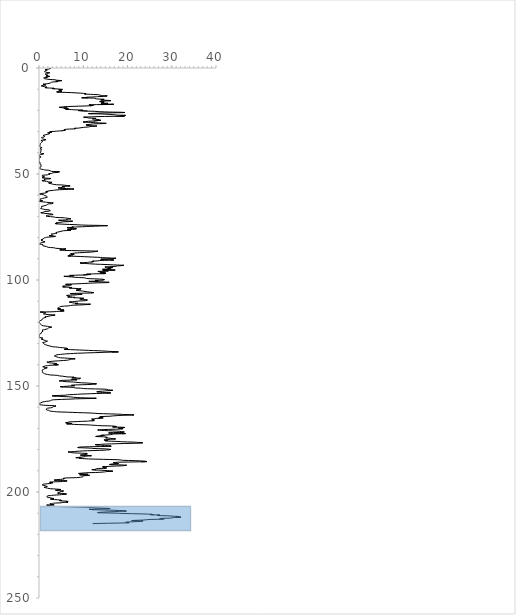
| Category | Series 0 |
|---|---|
| 2.2511769205039776 | 0 |
| 2.688813636029843 | 0.09 |
| 2.639082359440988 | 0.18 |
| 2.4865723846624084 | 0.27 |
| 2.3605859592779366 | 0.36 |
| 2.3108546751065977 | 0.45 |
| 2.1019828070659496 | 0.54 |
| 1.8765333205108918 | 0.63 |
| 1.3891651809407195 | 0.72 |
| 1.2001857398686149 | 0.81 |
| 1.3991114992662654 | 0.9 |
| 1.8400636023842034 | 0.99 |
| 1.7074464212776368 | 1.08 |
| 1.6577151164559263 | 1.17 |
| 1.4289502979283457 | 1.26 |
| 1.5151515067449355 | 1.35 |
| 1.581460204059943 | 1.44 |
| 1.5748291525476514 | 1.53 |
| 1.4190039795807288 | 1.62 |
| 1.3361182729211523 | 1.71 |
| 1.2499171785039467 | 1.8 |
| 1.4985743539476972 | 1.89 |
| 1.6742920883038348 | 1.98 |
| 1.7505468895784435 | 2.07 |
| 2.06219739652129 | 2.16 |
| 2.403686778767736 | 2.25 |
| 2.118559764024824 | 2.34 |
| 1.9992041701688223 | 2.43 |
| 2.005835245123876 | 2.52 |
| 2.0323587407710684 | 2.61 |
| 1.6742920883038348 | 2.7 |
| 1.4753665171510322 | 2.79 |
| 1.3759033923663697 | 2.88 |
| 1.3062794467804095 | 2.97 |
| 1.3659570748759664 | 3.06 |
| 1.7140773832092684 | 3.15 |
| 1.6146143542890554 | 3.24 |
| 1.6543995175551742 | 3.33 |
| 2.029043268550302 | 3.42 |
| 2.0655128686463993 | 3.51 |
| 1.866586993653683 | 3.6 |
| 1.6378223610090072 | 3.69 |
| 2.0555665381910995 | 3.78 |
| 2.1815529662097557 | 3.87 |
| 2.4335255227741737 | 3.96 |
| 2.2710694808998455 | 4.05 |
| 1.9096876664495908 | 4.14 |
| 1.5250978274360967 | 4.23 |
| 1.6411378322695447 | 4.32 |
| 1.859956159351224 | 4.41 |
| 1.5317286773486711 | 4.5 |
| 1.3526955468908735 | 4.59 |
| 1.047675806992692 | 4.68 |
| 1.2698096862087744 | 4.77 |
| 1.1106689501454097 | 4.86 |
| 0.9747364724776975 | 4.95 |
| 1.2764405317984906 | 5.04 |
| 1.3659570748759664 | 5.13 |
| 1.4753665171510322 | 5.22 |
| 1.9992041701688223 | 5.31 |
| 2.4998341961092723 | 5.4 |
| 3.1231349836464326 | 5.49 |
| 3.766328347748789 | 5.58 |
| 3.968569597615182 | 5.67 |
| 3.9984082560363983 | 5.76 |
| 4.552085511219727 | 5.85 |
| 5.165440004668776 | 5.94 |
| 5.012930056960483 | 6.03 |
| 4.27358926273196 | 6.12 |
| 3.7895367638452693 | 6.21 |
| 3.9652542277449854 | 6.3 |
| 4.257012101671626 | 6.39 |
| 3.8226908019890953 | 6.48 |
| 3.3717920385836173 | 6.57 |
| 2.8678468397003125 | 6.66 |
| 2.8181153529727174 | 6.75 |
| 2.9673098437245353 | 6.84 |
| 2.9838872483696677 | 6.93 |
| 2.9838872483696677 | 7.02 |
| 2.523042239277359 | 7.11 |
| 2.6423976168359316 | 7.2 |
| 2.363901540302277 | 7.29 |
| 1.9958889157170971 | 7.38 |
| 1.6179298253619614 | 7.47 |
| 1.210132054585035 | 7.56 |
| 0.9448975854221768 | 7.65 |
| 0.7293946084532117 | 7.74 |
| 0.9813672044891891 | 7.83 |
| 1.5516211482595383 | 7.92 |
| 1.4156886503711517 | 8.01 |
| 0.9813672044891891 | 8.1 |
| 0.8885352125704379 | 8.19 |
| 0.9482129891971947 | 8.28 |
| 0.8288575136844936 | 8.37 |
| 0.48405274983837326 | 8.46 |
| 0.4674756474982721 | 8.55 |
| 0.7957032091731224 | 8.64 |
| 0.9681055656056679 | 8.73 |
| 1.2068164745981702 | 8.82 |
| 1.5018898248292947 | 8.91 |
| 1.7472316362120328 | 9 |
| 1.899741556088483 | 9.09 |
| 1.7240235988200199 | 9.18 |
| 1.3891651809407195 | 9.27 |
| 1.7240235988200199 | 9.36 |
| 2.3572709648930514 | 9.45 |
| 3.3320073127465917 | 9.54 |
| 3.2889067873987834 | 9.63 |
| 2.9805715586778496 | 9.72 |
| 3.670181068392891 | 9.81 |
| 4.323320708350091 | 9.9 |
| 4.548770139292955 | 9.99 |
| 5.308003841765803 | 10.08 |
| 5.026191816606629 | 10.17 |
| 4.843843267119453 | 10.26 |
| 4.442676071814309 | 10.35 |
| 4.237119828964742 | 10.44 |
| 4.409521959685211 | 10.53 |
| 4.847158639910798 | 10.62 |
| 5.082554043291679 | 10.71 |
| 5.02287654866391 | 10.8 |
| 4.707910564566722 | 10.89 |
| 5.158808941232753 | 10.98 |
| 5.347788610989579 | 11.07 |
| 4.7609573163784304 | 11.16 |
| 3.9917780216767653 | 11.25 |
| 3.905576724221334 | 11.34 |
| 4.525562012206225 | 11.43 |
| 6.143491591374976 | 11.52 |
| 7.264106898037925 | 11.61 |
| 8.116172819134166 | 11.7 |
| 8.126118958566957 | 11.79 |
| 9.45229089747151 | 11.88 |
| 10.118692241760671 | 11.97 |
| 10.609375633100557 | 12.06 |
| 10.47012820275636 | 12.15 |
| 10.291094810403246 | 12.24 |
| 10.718784944571436 | 12.33 |
| 11.666998328095717 | 12.42 |
| 12.340029772184055 | 12.51 |
| 13.467277133806906 | 12.6 |
| 13.633048653059973 | 12.69 |
| 13.394337212797394 | 12.78 |
| 13.467277133806906 | 12.87 |
| 14.057424081389481 | 12.96 |
| 14.408859593639377 | 13.05 |
| 15.41674959126749 | 13.14 |
| 15.502951546290362 | 13.23 |
| 14.975798129098838 | 13.32 |
| 14.49174390523715 | 13.41 |
| 13.261719469984143 | 13.5 |
| 12.94675448701678 | 13.59 |
| 11.87918568351841 | 13.68 |
| 10.851402758680583 | 13.77 |
| 10.678999682306344 | 13.86 |
| 10.443604425358146 | 13.95 |
| 9.64790124887687 | 14.04 |
| 11.13652917873431 | 14.13 |
| 12.27040638581407 | 14.22 |
| 12.588687480111965 | 14.31 |
| 12.58205762972516 | 14.4 |
| 12.459386131362562 | 14.49 |
| 12.9732776399588 | 14.58 |
| 13.848550866699371 | 14.67 |
| 14.723824746982531 | 14.76 |
| 14.720509057342223 | 14.85 |
| 14.534845811556089 | 14.94 |
| 13.957960052398994 | 15.03 |
| 13.91154341872643 | 15.12 |
| 14.637623771868846 | 15.21 |
| 15.81128515361935 | 15.3 |
| 16.21576803009936 | 15.39 |
| 15.744976735910502 | 15.48 |
| 14.660832029472795 | 15.57 |
| 14.385650397184202 | 15.66 |
| 14.103838983637749 | 15.75 |
| 13.709303308928355 | 15.84 |
| 13.490484592252294 | 15.93 |
| 14.727138673264578 | 16.02 |
| 14.866388919595883 | 16.11 |
| 14.780187813839923 | 16.2 |
| 14.53152917353584 | 16.29 |
| 14.077315843241212 | 16.38 |
| 13.91154341872643 | 16.47 |
| 14.369073537734279 | 16.56 |
| 15.595783086478878 | 16.65 |
| 15.234400327316699 | 16.74 |
| 14.740401594806714 | 16.83 |
| 13.99774530885122 | 16.92 |
| 14.803395257201302 | 17.01 |
| 16.87885489133338 | 17.1 |
| 16.235659767779893 | 17.19 |
| 12.979908197344473 | 17.28 |
| 11.289039678539678 | 17.37 |
| 11.696837314859158 | 17.46 |
| 11.945495035442924 | 17.55 |
| 12.29361385754075 | 17.64 |
| 12.25382863935043 | 17.73 |
| 11.521119682128807 | 17.82 |
| 10.635899401683808 | 17.91 |
| 8.978184021596084 | 18 |
| 7.678535783838194 | 18.09 |
| 6.471719674192271 | 18.18 |
| 5.576553189633477 | 18.27 |
| 5.238379638221085 | 18.36 |
| 4.9698296941227005 | 18.45 |
| 4.558716517542522 | 18.54 |
| 4.654863705540776 | 18.63 |
| 5.245010596951963 | 18.72 |
| 5.994297650711471 | 18.81 |
| 6.421987978319282 | 18.9 |
| 5.629599928818763 | 18.99 |
| 5.407466419743819 | 19.08 |
| 6.004244369142409 | 19.17 |
| 6.627545034855889 | 19.26 |
| 6.0075590793260085 | 19.35 |
| 6.226377584612452 | 19.44 |
| 6.859624916808982 | 19.53 |
| 7.274053017876215 | 19.62 |
| 7.840991728299215 | 19.71 |
| 9.00802370930272 | 19.8 |
| 9.879981679505551 | 19.89 |
| 9.561700292055326 | 19.98 |
| 8.838936065180285 | 20.07 |
| 8.65658726442283 | 20.16 |
| 8.998076944416704 | 20.25 |
| 10.997280969241833 | 20.34 |
| 12.469332646700062 | 20.43 |
| 13.11915635361981 | 20.52 |
| 13.573369873090096 | 20.61 |
| 14.803395257201302 | 20.7 |
| 15.980373292497529 | 20.79 |
| 18.523307478056307 | 20.88 |
| 19.421789020455876 | 20.97 |
| 18.858166187108623 | 21.06 |
| 16.587096222008178 | 21.15 |
| 14.425436611839354 | 21.24 |
| 13.09926385368142 | 21.33 |
| 11.892447595903104 | 21.42 |
| 11.172999545035896 | 21.51 |
| 12.03169617169803 | 21.6 |
| 14.20993248543635 | 21.69 |
| 15.111730745065605 | 21.78 |
| 16.059942828546383 | 21.87 |
| 15.844439829949511 | 21.96 |
| 16.9186400244278 | 22.05 |
| 16.749551877014284 | 22.14 |
| 17.71765756568713 | 22.23 |
| 19.56103731815307 | 22.32 |
| 19.435051100236358 | 22.41 |
| 18.718917006150328 | 22.5 |
| 18.48352232671391 | 22.59 |
| 19.30243328891959 | 22.68 |
| 17.429215689416395 | 22.77 |
| 14.770240581239042 | 22.86 |
| 12.853921838189866 | 22.95 |
| 11.819508820322275 | 23.04 |
| 10.354088076356781 | 23.13 |
| 10.082222275424662 | 23.22 |
| 10.208208689124545 | 23.31 |
| 10.907764625199793 | 23.4 |
| 11.027120251898483 | 23.49 |
| 11.182945131897029 | 23.58 |
| 11.948809747896515 | 23.67 |
| 12.890391380094766 | 23.76 |
| 12.611896616488602 | 23.85 |
| 12.051588490517883 | 23.94 |
| 12.489225118457117 | 24.03 |
| 12.538955745553986 | 24.12 |
| 12.439493798967105 | 24.21 |
| 12.535640056024056 | 24.3 |
| 13.457330875891 | 24.39 |
| 13.619786499772516 | 24.48 |
| 13.11915635361981 | 24.57 |
| 13.938068289002075 | 24.66 |
| 13.812082071085365 | 24.75 |
| 13.838605368576406 | 24.84 |
| 13.924806331218164 | 24.93 |
| 12.320137991274944 | 25.02 |
| 11.156421959088252 | 25.11 |
| 11.212784117998243 | 25.2 |
| 11.196207152923424 | 25.29 |
| 10.393872875667668 | 25.38 |
| 9.97281342042185 | 25.47 |
| 10.41708124346218 | 25.56 |
| 11.726675322081292 | 25.65 |
| 12.386446370979433 | 25.74 |
| 12.824083961426059 | 25.83 |
| 13.722564500701779 | 25.92 |
| 14.922751037337537 | 26.01 |
| 15.184669760592676 | 26.1 |
| 14.91943518228813 | 26.19 |
| 13.517008699423888 | 26.28 |
| 12.359923210936891 | 26.37 |
| 12.005171898639063 | 26.46 |
| 11.988594959758924 | 26.55 |
| 12.028379372536389 | 26.64 |
| 10.867979262261768 | 26.73 |
| 10.616007012057393 | 26.82 |
| 10.6458456014122 | 26.91 |
| 10.493335991758775 | 27 |
| 10.7254164426773 | 27.09 |
| 11.315561866067869 | 27.18 |
| 12.194151776154294 | 27.27 |
| 13.062793488593933 | 27.36 |
| 12.787612628165467 | 27.45 |
| 11.73662239089184 | 27.54 |
| 11.796300365080949 | 27.63 |
| 11.670314147164241 | 27.72 |
| 11.163052476225353 | 27.81 |
| 10.609375633100557 | 27.9 |
| 10.08885376640056 | 27.99 |
| 9.873350790808654 | 28.08 |
| 10.062329870544993 | 28.17 |
| 10.178370001940698 | 28.26 |
| 8.945030448694812 | 28.35 |
| 8.056494947302985 | 28.44 |
| 8.321729917541793 | 28.53 |
| 8.140806829960548 | 28.62 |
| 7.961815543868581 | 28.71 |
| 6.841460170377833 | 28.8 |
| 6.228247327455203 | 28.89 |
| 5.883523004408026 | 28.98 |
| 5.886837611470963 | 29.07 |
| 5.638238139287209 | 29.16 |
| 5.97964755737901 | 29.25 |
| 6.075773333883023 | 29.34 |
| 6.049255921736279 | 29.43 |
| 5.9730183810155495 | 29.52 |
| 5.250422673136064 | 29.61 |
| 4.600748968048323 | 29.7 |
| 3.99748080257877 | 29.79 |
| 3.4041564064220666 | 29.88 |
| 2.9069575681452684 | 29.97 |
| 2.4462196240704266 | 30.06 |
| 2.4163876964738553 | 30.15 |
| 2.883754859223419 | 30.24 |
| 2.807517853225645 | 30.33 |
| 2.1777321308368918 | 30.42 |
| 2.1744174275789065 | 30.51 |
| 1.9258180474495388 | 30.6 |
| 1.9655937845814857 | 30.69 |
| 2.190990751302221 | 30.78 |
| 2.485995610109222 | 30.87 |
| 2.47936631052608 | 30.96 |
| 2.4429050561672874 | 31.05 |
| 2.413072992767238 | 31.14 |
| 2.263913143448734 | 31.23 |
| 1.9556497637803243 | 31.32 |
| 1.7733434909971448 | 31.41 |
| 1.4219895351316525 | 31.5 |
| 1.2595710122178758 | 31.59 |
| 1.1402432151791924 | 31.68 |
| 0.9115317045086462 | 31.77 |
| 0.9579369643974255 | 31.86 |
| 1.0441181461763382 | 31.95 |
| 1.2628857132400468 | 32.04 |
| 1.4286188289524322 | 32.13 |
| 1.2894030220246389 | 32.22 |
| 1.123670030620423 | 32.31 |
| 1.2960324388959454 | 32.4 |
| 1.2396831355507596 | 32.49 |
| 1.1634459274584352 | 32.58 |
| 0.792203910294881 | 32.67 |
| 0.6098975802833918 | 32.76 |
| 0.5402897172086185 | 32.85 |
| 0.49056979285796165 | 32.94 |
| 0.47731113299123673 | 33.03 |
| 0.4408498559595504 | 33.12 |
| 0.41433259814998413 | 33.21 |
| 0.6198415984218091 | 33.3 |
| 0.8187211513954361 | 33.39 |
| 0.9247903626268048 | 33.48 |
| 0.8618117758143374 | 33.57 |
| 1.10709672204951 | 33.66 |
| 1.5877225119369023 | 33.75 |
| 1.6208691302665026 | 33.84 |
| 1.445191990230083 | 33.93 |
| 1.1037820870187067 | 34.02 |
| 0.7192814013169356 | 34.11 |
| 0.4275912567476659 | 34.2 |
| 0.43422053497219165 | 34.29 |
| 0.3944446257055664 | 34.38 |
| 0.2618581878475798 | 34.47 |
| 0.41433259814998413 | 34.56 |
| 0.8352945399933143 | 34.65 |
| 1.0176008148607985 | 34.74 |
| 0.8684411531871686 | 34.83 |
| 0.8054625769363352 | 34.92 |
| 0.9115317045086462 | 35.01 |
| 0.6861347542556911 | 35.1 |
| 0.513772407395111 | 35.19 |
| 0.41433259814998413 | 35.28 |
| 0.40438862831355105 | 35.37 |
| 0.43090590095963704 | 35.46 |
| 0.3513540476010533 | 35.55 |
| 0.2883754866188265 | 35.64 |
| 0.26517284536042257 | 35.73 |
| 0.2419702379988303 | 35.82 |
| 0.1823063546977155 | 35.91 |
| 0.12264243459691074 | 36 |
| 0.13258642067974868 | 36.09 |
| 0.32152208020078915 | 36.18 |
| 0.2552288566269716 | 36.27 |
| 0.21876759496464748 | 36.36 |
| 0.1823063546977155 | 36.45 |
| 0.11932779239569775 | 36.54 |
| 0.11601312688541636 | 36.63 |
| 0.13258642067974868 | 36.72 |
| 0.12927175539525518 | 36.81 |
| 0.0762371938638118 | 36.9 |
| 0.056349233551244785 | 36.99 |
| 0.0762371938638118 | 37.08 |
| 0.21545294041682875 | 37.17 |
| 0.2983194653940919 | 37.26 |
| 0.32815140075128224 | 37.35 |
| 0.31820741089183563 | 37.44 |
| 0.3845006566248226 | 37.53 |
| 0.692764076538938 | 37.62 |
| 0.5270310675350603 | 37.71 |
| 0.32152208020078915 | 37.8 |
| 0.2883754866188265 | 37.89 |
| 0.3778713248055464 | 37.98 |
| 0.43090590095963704 | 38.07 |
| 0.503828391948496 | 38.16 |
| 0.4608906375102383 | 38.25 |
| 0.3448390002059624 | 38.34 |
| 0.39125968994519666 | 38.43 |
| 0.5205743125439757 | 38.52 |
| 0.6167313142230625 | 38.61 |
| 0.7493617150457694 | 38.7 |
| 0.6001525168202945 | 38.79 |
| 0.4277330136184033 | 38.88 |
| 0.36804934078442614 | 38.97 |
| 0.351470529985123 | 39.06 |
| 0.437680280970444 | 39.15 |
| 0.5039954791965717 | 39.24 |
| 0.5437845796825201 | 39.33 |
| 0.48741668540585653 | 39.42 |
| 0.4476275879270094 | 39.51 |
| 0.39457543744570195 | 39.6 |
| 0.4409960573051831 | 39.69 |
| 0.4277330136184033 | 39.78 |
| 0.21220862734575313 | 39.87 |
| 0.0795782379325111 | 39.96 |
| 0.013263039185697097 | 40.05 |
| 0.15584069621665958 | 40.14 |
| 0.2553134966762873 | 40.23 |
| 0.5404688363478712 | 40.32 |
| 1.061043109850693 | 40.41 |
| 1.230146816242189 | 40.5 |
| 1.0743061672754894 | 40.59 |
| 0.7526774674138614 | 40.68 |
| 0.5371530599170911 | 40.77 |
| 0.3448390002059624 | 40.86 |
| 0.3713651169149385 | 40.95 |
| 0.16910374466210495 | 41.04 |
| 0.0 | 41.13 |
| 0.0 | 41.22 |
| 0.019894559102658943 | 41.31 |
| 0.14589343989359593 | 41.4 |
| 0.1923140785732119 | 41.49 |
| 0.10278855607665452 | 41.58 |
| 0.05968367453137687 | 41.67 |
| 0.03647335629487137 | 41.76 |
| 0.029841835905869918 | 41.85 |
| 0.4675221055533252 | 41.94 |
| 0.4774693732023226 | 42.03 |
| 0.31831293968177277 | 42.12 |
| 0.14920919347858455 | 42.21 |
| 0.11936735245269613 | 42.3 |
| 0.046420639186319154 | 42.39 |
| 0.046420639186319154 | 42.48 |
| 0.03315759553707296 | 42.57 |
| 0.0795782379325111 | 42.66 |
| 0.10610430596182871 | 42.75 |
| 0.11273582366486266 | 42.84 |
| 0.1259988716227402 | 42.93 |
| 0.0928412744531417 | 43.02 |
| 0.046420639186319154 | 43.11 |
| 0.02652607599750737 | 43.2 |
| 0.0033157597337947534 | 43.29 |
| 0.029841835905869918 | 43.38 |
| 0.05305215375427108 | 43.47 |
| 0.06631519611317266 | 43.56 |
| 0.006631519373840251 | 43.65 |
| 0.03315759553707296 | 43.74 |
| 0.019894559102658943 | 43.83 |
| 0.019894559102658943 | 43.92 |
| 0.023210321232419347 | 44.01 |
| 0.046420639186319154 | 44.1 |
| 0.05305215375427108 | 44.19 |
| 0.03647335629487137 | 44.28 |
| 0.02652607599750737 | 44.37 |
| 0.013263039185697097 | 44.46 |
| 0.1591564606032166 | 44.55 |
| 0.2851553253617323 | 44.64 |
| 0.12268310714934057 | 44.73 |
| 0.023210321232419347 | 44.82 |
| 0.02652607599750737 | 44.91 |
| 0.11936735245269613 | 45 |
| 0.18899832498270341 | 45.09 |
| 0.3481547650870792 | 45.18 |
| 0.4807851658601089 | 45.27 |
| 0.47415364112148395 | 45.36 |
| 0.39125968994519666 | 45.45 |
| 0.21552436828819063 | 45.54 |
| 0.27520803931319804 | 45.63 |
| 0.45094332512455343 | 45.72 |
| 0.4841009090582388 | 45.81 |
| 0.32162870468395405 | 45.9 |
| 0.22547165329792873 | 45.99 |
| 0.43436453298016287 | 46.08 |
| 0.500679741303553 | 46.17 |
| 0.4608906375102383 | 46.26 |
| 0.47415364112148395 | 46.35 |
| 0.4012069169048769 | 46.44 |
| 0.39457543744570195 | 46.53 |
| 0.513942786728652 | 46.62 |
| 0.4045226929448662 | 46.71 |
| 0.36473359379430353 | 46.8 |
| 0.29178684699353574 | 46.89 |
| 0.2188401217245175 | 46.98 |
| 0.08952551469620126 | 47.07 |
| 0.10610430596182871 | 47.16 |
| 0.2188401217245175 | 47.25 |
| 0.25199774293785243 | 47.34 |
| 0.2188401217245175 | 47.43 |
| 0.22215588871708042 | 47.52 |
| 0.27189230487105664 | 47.61 |
| 0.4608906375102383 | 47.7 |
| 0.6167313142230625 | 47.79 |
| 0.9615703947876317 | 47.88 |
| 1.1472529601303005 | 47.97 |
| 1.210252452659474 | 48.06 |
| 1.5882490390562842 | 48.15 |
| 2.241453570432692 | 48.24 |
| 2.387347075018311 | 48.33 |
| 2.1917171178722685 | 48.42 |
| 2.0955602004416605 | 48.51 |
| 2.374084054537571 | 48.6 |
| 2.380715577914686 | 48.69 |
| 2.868132166589213 | 48.78 |
| 4.3138033740422905 | 48.87 |
| 4.6387480529220575 | 48.96 |
| 4.579064249750235 | 49.05 |
| 4.472960127956624 | 49.14 |
| 4.486223195626614 | 49.23 |
| 3.859544160312783 | 49.32 |
| 3.193076494287381 | 49.41 |
| 3.030604533700897 | 49.5 |
| 3.0936040345205704 | 49.59 |
| 3.040551872658502 | 49.68 |
| 2.8018168673698605 | 49.77 |
| 2.2082961539358283 | 49.86 |
| 2.4735570303245416 | 49.95 |
| 2.6658707924663285 | 50.04 |
| 2.2082961539358283 | 50.13 |
| 2.27792717227444 | 50.22 |
| 2.2116118723485645 | 50.31 |
| 1.9231406798727733 | 50.4 |
| 1.379356083791402 | 50.49 |
| 0.7758878366650205 | 50.58 |
| 0.706256882183133 | 50.67 |
| 0.9350442737777486 | 50.76 |
| 0.8289399781125159 | 50.85 |
| 0.6333101498813551 | 50.94 |
| 0.6764149845787213 | 51.03 |
| 0.7559932885813289 | 51.12 |
| 0.5902052027422915 | 51.21 |
| 0.8819921266869719 | 51.3 |
| 1.2533572254824024 | 51.39 |
| 0.9350442737777486 | 51.48 |
| 0.8587817540798743 | 51.57 |
| 0.7990981190988544 | 51.66 |
| 0.7128883671015994 | 51.75 |
| 0.6929938215157302 | 51.84 |
| 1.3130409017981686 | 51.93 |
| 2.1386650536636758 | 52.02 |
| 2.679133818922997 | 52.11 |
| 2.798501279603328 | 52.2 |
| 2.387347075018311 | 52.29 |
| 1.468881576399915 | 52.38 |
| 1.12072686433671 | 52.47 |
| 1.0577273649889436 | 52.56 |
| 1.031201229641617 | 52.65 |
| 1.210252452659474 | 52.74 |
| 1.4556185756721296 | 52.83 |
| 1.3859877001891783 | 52.92 |
| 1.097516438803991 | 53.01 |
| 0.6664677129092176 | 53.1 |
| 0.7261513481147034 | 53.19 |
| 1.047780042015487 | 53.28 |
| 1.3196724076007476 | 53.37 |
| 1.6810901780646221 | 53.46 |
| 1.578301745179426 | 53.55 |
| 1.6413011118313552 | 53.64 |
| 2.1618752603367755 | 53.73 |
| 2.5365562853141377 | 53.82 |
| 2.897974249171495 | 53.91 |
| 2.8316589782347745 | 54 |
| 2.539871834836923 | 54.09 |
| 2.175138299672602 | 54.18 |
| 2.085613119851076 | 54.27 |
| 2.2049803515583206 | 54.36 |
| 2.503398631303464 | 54.45 |
| 2.4569779606095645 | 54.54 |
| 2.6061870231225455 | 54.63 |
| 2.9609737483536747 | 54.72 |
| 3.0339201227369355 | 54.81 |
| 3.3091281127126497 | 54.9 |
| 3.481547682255469 | 54.99 |
| 3.9888587081447247 | 55.08 |
| 5.179216488717733 | 55.17 |
| 5.69647517762266 | 55.26 |
| 5.766106056568264 | 55.35 |
| 5.892105012210603 | 55.44 |
| 6.604993795214903 | 55.53 |
| 7.036042357406702 | 55.62 |
| 6.558573485505514 | 55.71 |
| 5.706422252277798 | 55.8 |
| 5.189163809806414 | 55.89 |
| 5.451109054481205 | 55.98 |
| 5.829105502114258 | 56.07 |
| 5.570476224202899 | 56.16 |
| 5.633475732242257 | 56.25 |
| 5.4113200172039715 | 56.34 |
| 4.9437976790000135 | 56.43 |
| 4.330382138248833 | 56.52 |
| 4.267383000540548 | 56.61 |
| 4.333698205705233 | 56.7 |
| 5.242215830564409 | 56.79 |
| 6.289996571271416 | 56.88 |
| 7.400775574301195 | 56.97 |
| 7.881560788349246 | 57.06 |
| 7.526774525336473 | 57.15 |
| 6.7575182390157 | 57.24 |
| 5.6666336011730065 | 57.33 |
| 4.575748654009666 | 57.42 |
| 4.0687071681491815 | 57.51 |
| 3.56799420422596 | 57.6 |
| 3.3192955933079924 | 57.69 |
| 2.9445899819320784 | 57.78 |
| 2.4803527785030455 | 57.87 |
| 2.2946579475294873 | 57.96 |
| 1.989587727933015 | 58.05 |
| 1.8072089082311518 | 58.14 |
| 1.6878337368128156 | 58.23 |
| 2.0492754636049435 | 58.32 |
| 2.1719666517564646 | 58.41 |
| 1.4955068314890128 | 58.5 |
| 1.3694996175803407 | 58.59 |
| 1.5717744931208575 | 58.68 |
| 1.7276253305319635 | 58.77 |
| 1.8569485616117674 | 58.86 |
| 1.4888748830437444 | 58.95 |
| 1.1871207878792447 | 59.04 |
| 0.7096196065397431 | 59.13 |
| 0.3713897476269761 | 59.22 |
| 0.32496601412019205 | 59.31 |
| 0.2884902260672003 | 59.4 |
| 0.09947939374301525 | 59.49 |
| 0.2122226784847849 | 59.58 |
| 0.5902443545247013 | 59.67 |
| 0.9947938838398479 | 59.76 |
| 1.2136485116877573 | 59.85 |
| 1.0180058129924057 | 59.94 |
| 0.9583182060938404 | 60.03 |
| 1.1804887348045139 | 60.12 |
| 1.333023921240246 | 60.21 |
| 1.4722948733802674 | 60.3 |
| 1.631462016869361 | 60.39 |
| 1.7110455955033386 | 60.48 |
| 1.7641012947499817 | 60.57 |
| 1.7442052372809769 | 60.66 |
| 1.7607852538706865 | 60.75 |
| 1.896740446526887 | 60.84 |
| 2.0227477955154014 | 60.93 |
| 2.0161156204956323 | 61.02 |
| 1.8271049478178303 | 61.11 |
| 1.5750902955494923 | 61.2 |
| 1.1970687382925402 | 61.29 |
| 1.0511656000110476 | 61.38 |
| 0.8721026546785846 | 61.47 |
| 0.7361474836427404 | 61.56 |
| 0.5405046828267539 | 61.65 |
| 0.4310773507164851 | 61.74 |
| 0.24869847192602718 | 61.83 |
| 0.1890108602563872 | 61.92 |
| 0.17574692013765286 | 62.01 |
| 0.2785422800683639 | 62.1 |
| 0.22548661015918797 | 62.19 |
| 0.1591670183875188 | 62.28 |
| 0.25533043312335596 | 62.37 |
| 0.36475778871986575 | 62.46 |
| 0.7958351551145767 | 62.55 |
| 0.7460954606690159 | 62.64 |
| 0.34817785637656307 | 62.73 |
| 0.07626753489682106 | 62.82 |
| 0.1558510323170614 | 62.91 |
| 0.32496601412019205 | 63 |
| 0.6598799560238316 | 63.09 |
| 1.0843254040545227 | 63.18 |
| 1.4888748830437444 | 63.27 |
| 1.7276253305319635 | 63.36 |
| 2.254866156398137 | 63.45 |
| 2.7522631782052125 | 63.54 |
| 3.2231320294363597 | 63.63 |
| 3.246343949730545 | 63.72 |
| 3.1501807055804734 | 63.81 |
| 3.060649229462538 | 63.9 |
| 2.8285307637332 | 63.99 |
| 2.254866156398137 | 64.08 |
| 1.9763238369087957 | 64.17 |
| 1.9829557713433583 | 64.26 |
| 1.992903749638213 | 64.35 |
| 1.9232682531078609 | 64.44 |
| 2.1189110700900753 | 64.53 |
| 1.896740446526887 | 64.62 |
| 1.7176773574299409 | 64.71 |
| 1.555194572824844 | 64.8 |
| 1.3628676712254535 | 64.89 |
| 1.3098119687217902 | 64.98 |
| 1.326391880450182 | 65.07 |
| 0.9251583099116657 | 65.16 |
| 0.5736645118201035 | 65.25 |
| 0.4410253062747674 | 65.34 |
| 0.4343933469359641 | 65.43 |
| 0.4310773507164851 | 65.52 |
| 0.39460156816288955 | 65.61 |
| 0.40123352686648195 | 65.7 |
| 0.6001923284672948 | 65.79 |
| 0.726199518005363 | 65.88 |
| 0.7527273885865943 | 65.97 |
| 0.6101402476268164 | 66.06 |
| 0.48744901862269935 | 66.15 |
| 0.35149384509311904 | 66.24 |
| 0.36475778871986575 | 66.33 |
| 0.5338727232627193 | 66.42 |
| 0.7858871884493054 | 66.51 |
| 1.0445335821136044 | 66.6 |
| 1.2003847716714897 | 66.69 |
| 1.3960274836562143 | 66.78 |
| 2.0293795055063324 | 66.87 |
| 2.3211858528257667 | 66.96 |
| 2.314553890546444 | 67.05 |
| 2.1984946604051596 | 67.14 |
| 2.3377657747668494 | 67.23 |
| 2.563252291874266 | 67.32 |
| 2.6196238909252423 | 67.41 |
| 2.377557347405529 | 67.5 |
| 1.992903749638213 | 67.59 |
| 1.303179928299755 | 67.68 |
| 1.2700202640431575 | 67.77 |
| 1.2302284054638961 | 67.86 |
| 1.1473290641737295 | 67.95 |
| 1.1771728245556377 | 68.04 |
| 0.8588387221264413 | 68.13 |
| 0.4078654901659683 | 68.22 |
| 0.4310773507164851 | 68.31 |
| 0.7560434296752947 | 68.4 |
| 1.0710614664972407 | 68.49 |
| 1.36618358205949 | 68.58 |
| 1.8204730138874616 | 68.67 |
| 2.404085365490385 | 68.76 |
| 2.8849022537457727 | 68.85 |
| 3.0838611100174127 | 68.94 |
| 3.0639651459788775 | 69.03 |
| 3.1999204661924874 | 69.12 |
| 2.9280101534987466 | 69.21 |
| 2.364293555924667 | 69.3 |
| 2.1653345836368847 | 69.39 |
| 1.9166362976811613 | 69.48 |
| 1.7806810057723492 | 69.57 |
| 1.8602645829710218 | 69.66 |
| 1.7641012947499817 | 69.75 |
| 1.5850383759602065 | 69.84 |
| 1.5850383759602065 | 69.93 |
| 1.9962198801278723 | 70.02 |
| 2.6129919528913965 | 70.11 |
| 2.9479058980914328 | 70.2 |
| 3.4453028427310612 | 70.29 |
| 3.6674733433114026 | 70.38 |
| 3.747057081870558 | 70.47 |
| 4.70869124472278 | 70.56 |
| 5.7366451907829 | 70.65 |
| 6.058294665065658 | 70.74 |
| 6.021819005627397 | 70.83 |
| 6.094770997209139 | 70.92 |
| 6.794442879552366 | 71.01 |
| 7.222203995360962 | 71.1 |
| 6.920450090796537 | 71.19 |
| 6.58553581214022 | 71.28 |
| 6.449580126043684 | 71.37 |
| 6.691646885553492 | 71.46 |
| 6.622011442596514 | 71.55 |
| 6.051663416883341 | 71.64 |
| 5.279039861071679 | 71.73 |
| 4.440096848880284 | 71.82 |
| 4.4301488244682385 | 71.91 |
| 5.189508037567738 | 72 |
| 5.802964164383987 | 72.09 |
| 6.864078330178977 | 72.18 |
| 7.596909277833075 | 72.27 |
| 7.646649265762988 | 72.36 |
| 6.701594641936732 | 72.45 |
| 5.617269474647312 | 72.54 |
| 5.355307515766264 | 72.63 |
| 4.977285602268613 | 72.72 |
| 4.692111053851232 | 72.81 |
| 4.503100481121606 | 72.9 |
| 4.237822017892859 | 72.99 |
| 3.889644292123894 | 73.08 |
| 4.00901940722707 | 73.17 |
| 4.144974636185239 | 73.26 |
| 3.6343138013420857 | 73.35 |
| 3.717213503097874 | 73.44 |
| 4.111814705780443 | 73.53 |
| 4.983917266937297 | 73.62 |
| 5.8759155879193825 | 73.71 |
| 6.9502933300147856 | 73.8 |
| 8.114202734353029 | 73.89 |
| 8.813874657480772 | 73.98 |
| 9.656132648983785 | 74.07 |
| 11.135060001122062 | 74.16 |
| 13.893955365726377 | 74.25 |
| 15.49225716379562 | 74.34 |
| 15.094339015363733 | 74.43 |
| 13.953643080373046 | 74.52 |
| 12.806312769997286 | 74.61 |
| 11.519714038068141 | 74.7 |
| 10.740458157082605 | 74.79 |
| 9.884935508934875 | 74.88 |
| 8.482276254975819 | 74.97 |
| 7.434427096958045 | 75.06 |
| 7.752760296544273 | 75.15 |
| 7.73949682992261 | 75.24 |
| 6.37331286250431 | 75.33 |
| 6.260569853511913 | 75.42 |
| 6.34678552127602 | 75.51 |
| 6.386576539290233 | 75.6 |
| 7.57701310982047 | 75.69 |
| 8.465695886164259 | 75.78 |
| 8.419272553133636 | 75.87 |
| 8.452432156217151 | 75.96 |
| 8.061146922766802 | 76.05 |
| 7.6168055498789675 | 76.14 |
| 7.04314085604702 | 76.23 |
| 6.356733270501177 | 76.32 |
| 6.529164048626305 | 76.41 |
| 7.228835936460458 | 76.5 |
| 7.162516309504877 | 76.59 |
| 6.234041881069508 | 76.68 |
| 5.5072940937904775 | 76.77 |
| 5.4741379436625826 | 76.86 |
| 5.454243895246596 | 76.95 |
| 4.980106384942731 | 77.04 |
| 4.953580736830462 | 77.13 |
| 4.784482729729127 | 77.22 |
| 4.48939002813121 | 77.31 |
| 4.1744034561028664 | 77.4 |
| 4.0981434191670045 | 77.49 |
| 4.134615275882 | 77.58 |
| 3.822944315913992 | 77.67 |
| 3.8328913395111868 | 77.76 |
| 4.081564997293933 | 77.85 |
| 3.7798410559631352 | 77.94 |
| 3.70689666193301 | 78.03 |
| 3.822944315913992 | 78.12 |
| 3.352121993013809 | 78.21 |
| 2.7685676733848084 | 78.3 |
| 2.821618046812406 | 78.39 |
| 2.715517267113848 | 78.48 |
| 2.6724136730408383 | 78.57 |
| 3.023872834703351 | 78.66 |
| 3.183023925664078 | 78.75 |
| 2.9874003149505666 | 78.84 |
| 2.85145895438065 | 78.93 |
| 2.619363297865466 | 79.02 |
| 2.311007926798926 | 79.11 |
| 2.5165782848625997 | 79.2 |
| 3.282493512017428 | 79.29 |
| 3.7168436835395897 | 79.38 |
| 3.6405836607367554 | 79.47 |
| 3.418435316381164 | 79.56 |
| 2.9011936334187247 | 79.65 |
| 2.234747969708578 | 79.74 |
| 1.7440317091311306 | 79.83 |
| 1.6147214505035707 | 79.92 |
| 1.5119364072845187 | 80.01 |
| 1.1969496571455032 | 80.1 |
| 1.0377983936794832 | 80.19 |
| 1.021220157177501 | 80.28 |
| 0.9748010178781417 | 80.37 |
| 1.0245358799876083 | 80.46 |
| 1.0344826706066652 | 80.55 |
| 0.9582228645652393 | 80.64 |
| 0.8355438463060114 | 80.73 |
| 0.7758621003157331 | 80.82 |
| 0.8255968568466308 | 80.91 |
| 0.4708222360510903 | 81 |
| 0.7858090018100191 | 81.09 |
| 0.9350132581803703 | 81.18 |
| 0.6697612471769722 | 81.27 |
| 0.4807692181245734 | 81.36 |
| 0.7228116357428374 | 81.45 |
| 0.8720158905986992 | 81.54 |
| 0.8919098710253229 | 81.63 |
| 0.7758621003157331 | 81.72 |
| 0.9781166524206988 | 81.81 |
| 1.1903182636051663 | 81.9 |
| 1.3759946397858662 | 81.99 |
| 1.4091512641334876 | 82.08 |
| 1.1339522550098615 | 82.17 |
| 0.9515915181834225 | 82.26 |
| 0.7327586225982202 | 82.35 |
| 0.7228116357428374 | 82.44 |
| 0.37466843581502923 | 82.53 |
| 0.3050397834065379 | 82.62 |
| 0.27519894420444546 | 82.71 |
| 0.2851458698698428 | 82.8 |
| 0.33819629692639064 | 82.89 |
| 0.11604773988480978 | 82.98 |
| 0.14257294591533354 | 83.07 |
| 0.3183023847128483 | 83.16 |
| 0.5868700572723419 | 83.25 |
| 0.8919098710253229 | 83.34 |
| 0.9449602493187123 | 83.43 |
| 0.8090186012891692 | 83.52 |
| 0.8057028900485682 | 83.61 |
| 0.8123342445069218 | 83.7 |
| 0.7526525009580045 | 83.79 |
| 0.8852785151120864 | 83.88 |
| 0.9980106360264205 | 83.97 |
| 1.3627320817330053 | 84.06 |
| 1.4854111759657815 | 84.15 |
| 1.6810344346379076 | 84.24 |
| 1.5152520056644212 | 84.33 |
| 1.541777068707844 | 84.42 |
| 1.7340847251844076 | 84.51 |
| 2.078912446676072 | 84.6 |
| 2.6027852792710653 | 84.69 |
| 3.3488064052345945 | 84.78 |
| 3.352121993013809 | 84.87 |
| 3.4515915724791006 | 84.96 |
| 3.7798410559631352 | 85.05 |
| 4.585543964127799 | 85.14 |
| 5.2718832010738454 | 85.23 |
| 6.080901662779832 | 85.32 |
| 6.236737332871558 | 85.41 |
| 5.948275732439613 | 85.5 |
| 5.520556805021588 | 85.59 |
| 5.179045267865435 | 85.68 |
| 4.6850131651364455 | 85.77 |
| 4.6850131651364455 | 85.86 |
| 5.208885840402673 | 85.95 |
| 5.676392696576049 | 86.04 |
| 7.383951673156938 | 86.13 |
| 9.731432249253364 | 86.22 |
| 11.86671082996313 | 86.31 |
| 13.288893163127755 | 86.4 |
| 13.046794747019518 | 86.49 |
| 12.798063787510888 | 86.58 |
| 12.662089790030567 | 86.67 |
| 12.890923034927518 | 86.76 |
| 11.697012745449658 | 86.85 |
| 10.814844414807451 | 86.94 |
| 10.297482766407338 | 87.03 |
| 9.086989379130742 | 87.12 |
| 8.665804912428504 | 87.21 |
| 8.075481748260131 | 87.3 |
| 7.8864456699847745 | 87.39 |
| 7.56143657665598 | 87.48 |
| 7.156833903060137 | 87.57 |
| 7.050707982216385 | 87.66 |
| 7.501740979037944 | 87.75 |
| 7.952774098057761 | 87.84 |
| 7.395615777431912 | 87.93 |
| 7.50505735014962 | 88.02 |
| 7.65098018167044 | 88.11 |
| 7.083872223874945 | 88.2 |
| 6.81855874633471 | 88.29 |
| 7.014227534854621 | 88.38 |
| 7.17009936025473 | 88.47 |
| 6.83514125967276 | 88.56 |
| 6.523397518329148 | 88.65 |
| 7.253009407356345 | 88.74 |
| 8.370642809185954 | 88.83 |
| 9.458428584721611 | 88.92 |
| 10.224521756888501 | 89.01 |
| 11.28577573529934 | 89.1 |
| 12.065134161836383 | 89.19 |
| 13.189401145142346 | 89.28 |
| 13.915695721238578 | 89.37 |
| 14.343515460870062 | 89.46 |
| 14.535866528921614 | 89.55 |
| 16.36321456372958 | 89.64 |
| 17.401254144322834 | 89.73 |
| 17.537226310283348 | 89.82 |
| 16.860677416636772 | 89.91 |
| 15.175935952306599 | 90 |
| 14.237388227467182 | 90.09 |
| 13.9422285087675 | 90.18 |
| 13.972075447261364 | 90.27 |
| 14.688422350817174 | 90.36 |
| 15.855801485867872 | 90.45 |
| 16.93363732377603 | 90.54 |
| 16.230558312887418 | 90.63 |
| 14.804496915216436 | 90.72 |
| 13.736609629256535 | 90.81 |
| 13.779724391725967 | 90.9 |
| 13.278943715353439 | 90.99 |
| 12.138094712748218 | 91.08 |
| 12.211057351356324 | 91.17 |
| 12.406725337255098 | 91.26 |
| 12.26743632272803 | 91.35 |
| 12.43988990845322 | 91.44 |
| 11.799821181261503 | 91.53 |
| 11.153119419962106 | 91.62 |
| 10.924286509110557 | 91.71 |
| 10.871223004380932 | 91.8 |
| 9.932676474271998 | 91.89 |
| 9.266076227924747 | 91.98 |
| 9.475011186022526 | 92.07 |
| 10.221205376621619 | 92.16 |
| 10.81816069801516 | 92.25 |
| 11.418433039781691 | 92.34 |
| 11.564354587548964 | 92.43 |
| 12.76489921557651 | 92.52 |
| 13.952176971961395 | 92.61 |
| 15.139456484180114 | 92.7 |
| 16.04483777409085 | 92.79 |
| 16.890525309709076 | 92.88 |
| 18.114283375674827 | 92.97 |
| 19.17222058731595 | 93.06 |
| 19.208702735226897 | 93.15 |
| 18.43266127177932 | 93.24 |
| 17.719629233898285 | 93.33 |
| 17.636719110749915 | 93.42 |
| 17.447683743054025 | 93.51 |
| 17.470898083223652 | 93.6 |
| 17.484164271925472 | 93.69 |
| 15.759626492190689 | 93.78 |
| 14.900673006156323 | 93.87 |
| 15.205782903169407 | 93.96 |
| 16.217291235942838 | 94.05 |
| 16.638477668209333 | 94.14 |
| 16.17417845503994 | 94.23 |
| 16.08463405967756 | 94.32 |
| 15.617019865242929 | 94.41 |
| 15.467780748235718 | 94.5 |
| 15.749676279678729 | 94.59 |
| 16.19076020240712 | 94.68 |
| 16.27367016096794 | 94.77 |
| 15.212416430340323 | 94.86 |
| 14.363412997384076 | 94.95 |
| 15.089709290182704 | 95.04 |
| 15.86906767449609 | 95.13 |
| 16.658375338683115 | 95.22 |
| 17.215532852089996 | 95.31 |
| 15.918813951942115 | 95.4 |
| 14.41979194298722 | 95.49 |
| 14.416477013958579 | 95.58 |
| 15.67671471341145 | 95.67 |
| 15.36497223213637 | 95.76 |
| 14.628727674672307 | 95.85 |
| 13.302158102569106 | 95.94 |
| 13.448081550879158 | 96.03 |
| 13.69349754373704 | 96.12 |
| 14.476171690766057 | 96.21 |
| 15.043279445435243 | 96.3 |
| 14.220807367201571 | 96.39 |
| 13.822836474852684 | 96.48 |
| 13.72002764787389 | 96.57 |
| 13.836102388640636 | 96.66 |
| 14.035087758245608 | 96.75 |
| 14.257288619139215 | 96.84 |
| 15.099659327762849 | 96.93 |
| 14.353464547884334 | 97.02 |
| 12.3934601434779 | 97.11 |
| 11.14648655662647 | 97.2 |
| 10.728617634435254 | 97.29 |
| 11.70032857435374 | 97.38 |
| 11.892681539708615 | 97.47 |
| 11.564354587548964 | 97.56 |
| 9.929360095028496 | 97.65 |
| 8.244618893302189 | 97.74 |
| 6.928000330957507 | 97.83 |
| 7.166782990019188 | 97.92 |
| 7.840016161951592 | 98.01 |
| 7.299438930681363 | 98.1 |
| 6.5034987512847335 | 98.19 |
| 5.6312804957233045 | 98.28 |
| 6.118794081320882 | 98.37 |
| 6.712433599453778 | 98.46 |
| 7.395615777431912 | 98.55 |
| 7.491791269256161 | 98.64 |
| 8.165025188098037 | 98.73 |
| 8.89132064667589 | 98.82 |
| 9.949258881082756 | 98.91 |
| 10.390343026933875 | 99 |
| 10.23115441784513 | 99.09 |
| 10.41024124822933 | 99.18 |
| 10.731934135505217 | 99.27 |
| 11.29904159291181 | 99.36 |
| 12.489636071155468 | 99.45 |
| 13.617218209443651 | 99.54 |
| 14.360097268830184 | 99.63 |
| 14.509336263436683 | 99.72 |
| 14.787915121870757 | 99.81 |
| 14.824396373808401 | 99.9 |
| 14.894040427121672 | 99.99 |
| 14.171060989000415 | 100.08 |
| 12.731734643642135 | 100.17 |
| 12.648825433805655 | 100.26 |
| 12.78479692882614 | 100.35 |
| 13.36848724717411 | 100.44 |
| 12.595760646898068 | 100.53 |
| 11.269193699508191 | 100.62 |
| 11.617418382550536 | 100.71 |
| 12.87434103477063 | 100.8 |
| 14.512651349432762 | 100.89 |
| 15.292010410465698 | 100.98 |
| 15.852485740638059 | 101.07 |
| 15.882333633710367 | 101.16 |
| 15.341756928884712 | 101.25 |
| 13.162869346574476 | 101.34 |
| 12.065134161836383 | 101.43 |
| 11.275826557395632 | 101.52 |
| 10.353862057854188 | 101.61 |
| 9.544655376443032 | 101.7 |
| 8.795145212661632 | 101.79 |
| 7.395615777431912 | 101.88 |
| 6.32772891133412 | 101.97 |
| 6.002719117486637 | 102.06 |
| 6.884887062384344 | 102.15 |
| 7.352502706967575 | 102.24 |
| 7.312705007856782 | 102.33 |
| 7.113719928575294 | 102.42 |
| 6.971114267190737 | 102.51 |
| 7.044075327827059 | 102.6 |
| 6.884887062384344 | 102.69 |
| 5.943024129059776 | 102.78 |
| 5.6080653980202015 | 102.87 |
| 5.375916177544453 | 102.96 |
| 5.687659853001495 | 103.05 |
| 5.548369781351827 | 103.14 |
| 5.382548905786511 | 103.23 |
| 6.045832415483842 | 103.32 |
| 6.576459873603664 | 103.41 |
| 7.024176618437984 | 103.5 |
| 7.415514578564482 | 103.59 |
| 7.100454667785098 | 103.68 |
| 6.87162099301679 | 103.77 |
| 7.369084236549791 | 103.86 |
| 7.919610681162931 | 103.95 |
| 8.88137152201742 | 104.04 |
| 9.518124163454965 | 104.13 |
| 9.620933452755095 | 104.22 |
| 9.567870636259917 | 104.31 |
| 9.727059130928826 | 104.4 |
| 9.421947736165244 | 104.49 |
| 8.884687897693814 | 104.58 |
| 8.493350452029553 | 104.67 |
| 8.970915090554618 | 104.76 |
| 9.126786704718672 | 104.85 |
| 8.460186452827495 | 104.94 |
| 9.146684962303656 | 105.03 |
| 9.332404666128461 | 105.12 |
| 9.836500648170466 | 105.21 |
| 9.654097322407482 | 105.3 |
| 9.70052731548622 | 105.39 |
| 10.63907399362088 | 105.48 |
| 10.934235072835023 | 105.57 |
| 10.884489149382935 | 105.66 |
| 11.647266275954152 | 105.75 |
| 11.607468215906628 | 105.84 |
| 12.419992191595986 | 105.93 |
| 12.436574201287232 | 106.02 |
| 11.796504502031304 | 106.11 |
| 10.270951195692575 | 106.2 |
| 8.529831159502976 | 106.29 |
| 7.077239405671112 | 106.38 |
| 7.0805558540406555 | 106.47 |
| 7.594600953603238 | 106.56 |
| 9.007395438453369 | 106.65 |
| 9.740324113035577 | 106.74 |
| 9.259443985828932 | 106.83 |
| 8.69233554792073 | 106.92 |
| 8.393858020296546 | 107.01 |
| 7.541538608628801 | 107.1 |
| 6.510131455414768 | 107.19 |
| 6.258083503712928 | 107.28 |
| 6.453752835920302 | 107.37 |
| 6.629522849547421 | 107.46 |
| 6.463701907094261 | 107.55 |
| 6.516764886159697 | 107.64 |
| 6.947899113558768 | 107.73 |
| 7.09382192788092 | 107.82 |
| 6.831824270166837 | 107.91 |
| 6.493549129027741 | 108 |
| 7.51500706032531 | 108.09 |
| 8.045633996042538 | 108.18 |
| 7.813484514225596 | 108.27 |
| 8.048950981605888 | 108.36 |
| 8.964282339886537 | 108.45 |
| 9.77680496316751 | 108.54 |
| 10.091864964648591 | 108.63 |
| 9.869664410054995 | 108.72 |
| 9.484959692691698 | 108.81 |
| 9.232911757330815 | 108.9 |
| 9.431897476162533 | 108.99 |
| 9.690578280086406 | 109.08 |
| 10.138294969183303 | 109.17 |
| 10.09518124464627 | 109.26 |
| 10.234470911784555 | 109.35 |
| 10.947501219084968 | 109.44 |
| 10.937552048580516 | 109.53 |
| 10.755148848100662 | 109.62 |
| 10.582694812846379 | 109.71 |
| 10.1615096903965 | 109.8 |
| 8.990814052424204 | 109.89 |
| 8.752031230063364 | 109.98 |
| 8.689019172906955 | 110.07 |
| 7.9627238153676725 | 110.16 |
| 7.51500706032531 | 110.25 |
| 7.087188593731321 | 110.34 |
| 6.855039343481835 | 110.43 |
| 7.395615777431912 | 110.52 |
| 7.524956154926586 | 110.61 |
| 7.617815288939422 | 110.7 |
| 7.627765000657533 | 110.79 |
| 8.055582821156078 | 110.88 |
| 8.781879106717403 | 110.97 |
| 8.506615942344128 | 111.06 |
| 8.201505668668123 | 111.15 |
| 8.589526749302092 | 111.24 |
| 10.552846622842806 | 111.33 |
| 11.63068360231716 | 111.42 |
| 11.647266275954152 | 111.51 |
| 10.708718728792729 | 111.6 |
| 10.042118541278809 | 111.69 |
| 9.106887738575221 | 111.78 |
| 7.713992237645185 | 111.87 |
| 7.571385672000861 | 111.96 |
| 7.0805558540406555 | 112.05 |
| 7.17009936025473 | 112.14 |
| 6.596358643931735 | 112.23 |
| 5.7208240094507605 | 112.32 |
| 5.203462610483077 | 112.41 |
| 4.931515836967558 | 112.5 |
| 4.696050274259347 | 112.59 |
| 4.851921507744272 | 112.68 |
| 4.80549191362931 | 112.77 |
| 4.656253342695013 | 112.86 |
| 4.785593106415389 | 112.95 |
| 4.639671218782696 | 113.04 |
| 4.437369274012071 | 113.13 |
| 4.434052863794747 | 113.22 |
| 4.1952709255316245 | 113.31 |
| 4.055981300083208 | 113.4 |
| 4.6197725740874676 | 113.49 |
| 4.914933547654146 | 113.58 |
| 4.70599962376336 | 113.67 |
| 4.251649985753375 | 113.76 |
| 4.394256026421902 | 113.85 |
| 4.749112860744237 | 113.94 |
| 5.190196572505312 | 114.03 |
| 5.6478626555901394 | 114.12 |
| 5.555002886698554 | 114.21 |
| 5.472092617814192 | 114.3 |
| 4.918250121185326 | 114.39 |
| 5.190196572505312 | 114.48 |
| 5.684342859781231 | 114.57 |
| 5.5052565713432715 | 114.66 |
| 4.662885918184633 | 114.75 |
| 3.999601918571511 | 114.84 |
| 3.568467639134646 | 114.93 |
| 2.696249158042975 | 115.02 |
| 0.2743131538446907 | 115.11 |
| 0.9686682960176871 | 115.2 |
| 1.3287042842000865 | 115.29 |
| 1.4701469695442624 | 115.38 |
| 1.5730144724796717 | 115.47 |
| 1.414427140141003 | 115.56 |
| 1.3972825989485598 | 115.65 |
| 1.405854877998211 | 115.74 |
| 1.2215506665840592 | 115.83 |
| 1.0758219025508478 | 115.92 |
| 0.9943851597655262 | 116.01 |
| 1.144400190864549 | 116.1 |
| 1.4872916112076224 | 116.19 |
| 2.05306234615394 | 116.28 |
| 2.4688182664322493 | 116.37 |
| 3.347477677567749 | 116.46 |
| 3.6389351308641555 | 116.55 |
| 3.5789292120321834 | 116.64 |
| 3.128884264161454 | 116.73 |
| 2.755989897336453 | 116.82 |
| 2.520252072238268 | 116.91 |
| 2.357378601757876 | 117 |
| 2.494535302004558 | 117.09 |
| 2.4259569510219414 | 117.18 |
| 1.7787492464437111 | 117.27 |
| 1.3415627662733403 | 117.36 |
| 1.260126049774674 | 117.45 |
| 1.3629934308681935 | 117.54 |
| 1.594445135113413 | 117.63 |
| 1.3672796726392626 | 117.72 |
| 1.182975512464349 | 117.81 |
| 1.0758219025508478 | 117.9 |
| 0.9943851597655262 | 117.99 |
| 0.9686682960176871 | 118.08 |
| 0.934379191530541 | 118.17 |
| 0.7929364828264122 | 118.26 |
| 0.7543611318088872 | 118.35 |
| 0.818653263544853 | 118.44 |
| 0.8443701294973962 | 118.53 |
| 0.7800779592802646 | 118.62 |
| 0.7072135926362044 | 118.71 |
| 0.6729244929718505 | 118.8 |
| 0.5786292855738888 | 118.89 |
| 0.5229094527020413 | 118.98 |
| 0.4243281658342157 | 119.07 |
| 0.2143071424476707 | 119.16 |
| 0.15001500800278816 | 119.25 |
| 0.15430113375595556 | 119.34 |
| 0.09858129358009636 | 119.43 |
| 0.02571685733035459 | 119.52 |
| 0.0 | 119.61 |
| 0.0 | 119.7 |
| 0.0 | 119.79 |
| 0.0 | 119.88 |
| 0.0 | 119.97 |
| 0.0 | 120.06 |
| 0.021430713334191373 | 120.15 |
| 0.18001798685495093 | 120.24 |
| 0.1757318625695215 | 120.33 |
| 0.09858129358009636 | 120.42 |
| 0.008572286103041832 | 120.51 |
| 0.0 | 120.6 |
| 0.008572286103041832 | 120.69 |
| 0.10286742594500108 | 120.78 |
| 0.3900390080909792 | 120.87 |
| 0.39861128738422086 | 120.96 |
| 0.3043161341852347 | 121.05 |
| 0.3343191504812378 | 121.14 |
| 0.4414727238592011 | 121.23 |
| 0.5914877592613199 | 121.32 |
| 0.608632303546644 | 121.41 |
| 0.7157859061942208 | 121.5 |
| 0.9600959721529896 | 121.59 |
| 1.144400190864549 | 121.68 |
| 1.5901588764561305 | 121.77 |
| 1.9287641964233577 | 121.86 |
| 2.0744932414324575 | 121.95 |
| 2.2502248486650647 | 122.04 |
| 2.45595986600323 | 122.13 |
| 2.8674294006267087 | 122.22 |
| 2.953152391899905 | 122.31 |
| 2.5073935547307995 | 122.4 |
| 2.3830954022649804 | 122.49 |
| 2.1730743812813142 | 122.58 |
| 2.2587972240982594 | 122.67 |
| 2.203077534078528 | 122.76 |
| 2.1302129445709994 | 122.85 |
| 2.185932899779663 | 122.94 |
| 1.9116197954866219 | 123.03 |
| 1.834469293427304 | 123.12 |
| 1.9116197954866219 | 123.21 |
| 1.7015987630820553 | 123.3 |
| 1.272984374881474 | 123.39 |
| 0.9815267334812954 | 123.48 |
| 0.942951420135719 | 123.57 |
| 0.6900690369934553 | 123.66 |
| 0.6772105572528934 | 123.75 |
| 0.8015087216422803 | 123.84 |
| 0.775791845057408 | 123.93 |
| 0.7586472905665541 | 124.02 |
| 0.9386652132358261 | 124.11 |
| 0.8700870051460946 | 124.2 |
| 0.8015087216422803 | 124.29 |
| 0.8100810344364943 | 124.38 |
| 0.7286442532097458 | 124.47 |
| 0.5957738289792943 | 124.56 |
| 0.5657708695447305 | 124.65 |
| 0.6686382797437482 | 124.74 |
| 0.7072135926362044 | 124.83 |
| 0.6300629821975197 | 124.92 |
| 0.5743431547837576 | 125.01 |
| 0.5443401378839376 | 125.1 |
| 0.4757618805723367 | 125.19 |
| 0.3214607041172738 | 125.28 |
| 0.2528824312984285 | 125.37 |
| 0.19716256994502576 | 125.46 |
| 0.18001798685495093 | 125.55 |
| 0.1757318625695215 | 125.64 |
| 0.13287042324266995 | 125.73 |
| 0.08143672004002223 | 125.82 |
| 0.07715057061250453 | 125.91 |
| 0.07286443072714394 | 126 |
| 0.05571986267374838 | 126.09 |
| 0.042861427253052385 | 126.18 |
| 0.06857828773723802 | 126.27 |
| 0.051433713891540014 | 126.36 |
| 0.02571685733035459 | 126.45 |
| 0.02571685733035459 | 126.54 |
| 0.008572286103041832 | 126.63 |
| 0.008572286103041832 | 126.72 |
| 0.008572286103041832 | 126.81 |
| 0.012858427909787553 | 126.9 |
| 0.0 | 126.99 |
| 0.06857828773723802 | 127.08 |
| 0.1671595703876381 | 127.17 |
| 0.4671895962152945 | 127.26 |
| 0.8872315578327251 | 127.35 |
| 0.942951420135719 | 127.44 |
| 0.8872315578327251 | 127.53 |
| 0.8829454496320358 | 127.62 |
| 1.05867736283853 | 127.71 |
| 1.0029573879082956 | 127.8 |
| 0.4757618805723367 | 127.89 |
| 0.3043161341852347 | 127.98 |
| 0.4757618805723367 | 128.07 |
| 0.9258068674150278 | 128.16 |
| 1.05867736283853 | 128.25 |
| 0.9600959721529896 | 128.34 |
| 1.0415327030131947 | 128.43 |
| 1.1143970880421772 | 128.52 |
| 1.4358578037811052 | 128.61 |
| 1.6801679823738238 | 128.7 |
| 1.9201919369435498 | 128.79 |
| 2.0187733099274614 | 128.88 |
| 1.941622715246836 | 128.97 |
| 1.7444601842582883 | 129.06 |
| 1.5730144724796717 | 129.15 |
| 1.448716306549262 | 129.24 |
| 1.260126049774674 | 129.33 |
| 1.0629633529497657 | 129.42 |
| 0.8315117894350514 | 129.51 |
| 0.7029274336044963 | 129.6 |
| 0.7415027476885869 | 129.69 |
| 0.9515237321475519 | 129.78 |
| 1.0029573879082956 | 129.87 |
| 1.0329604746655432 | 129.96 |
| 1.0758219025508478 | 130.05 |
| 1.0972525500169292 | 130.14 |
| 1.1315417738832214 | 130.23 |
| 1.178689293073192 | 130.32 |
| 1.2686981936365451 | 130.41 |
| 1.4101410005903734 | 130.5 |
| 1.560155952489845 | 130.59 |
| 1.7658908455244129 | 130.68 |
| 1.8001799073485785 | 130.77 |
| 1.8687583558294787 | 130.86 |
| 2.0273456870740523 | 130.95 |
| 2.1945051580931234 | 131.04 |
| 2.45595986600323 | 131.13 |
| 2.4002400341176147 | 131.22 |
| 2.443101612425456 | 131.31 |
| 2.6231193668312187 | 131.4 |
| 3.0860230738546757 | 131.49 |
| 3.694655121826999 | 131.58 |
| 4.191847631012927 | 131.67 |
| 4.35472110468271 | 131.76 |
| 4.680467882071186 | 131.85 |
| 5.319103137891236 | 131.94 |
| 5.850585220204784 | 132.03 |
| 6.172046058530311 | 132.12 |
| 6.253482815433076 | 132.21 |
| 6.4849342778111145 | 132.3 |
| 6.51922345278118 | 132.39 |
| 6.416355768896964 | 132.48 |
| 5.914876945801981 | 132.57 |
| 5.687711856135418 | 132.66 |
| 6.039175191498079 | 132.75 |
| 7.140713757474234 | 132.84 |
| 8.255111157053141 | 132.93 |
| 9.095194929779803 | 133.02 |
| 10.248168137765102 | 133.11 |
| 11.135399004927867 | 133.2 |
| 12.318374499223527 | 133.29 |
| 13.505636410649895 | 133.38 |
| 14.410013542797678 | 133.47 |
| 15.224380103503456 | 133.56 |
| 15.751576093895642 | 133.65 |
| 16.685954091413834 | 133.74 |
| 17.500320644326766 | 133.83 |
| 17.941794566686163 | 133.92 |
| 16.424499128703538 | 134.01 |
| 14.680040244415505 | 134.1 |
| 13.985683152545159 | 134.19 |
| 12.498392714681815 | 134.28 |
| 10.771077137406152 | 134.37 |
| 9.978141123654247 | 134.46 |
| 8.675152736626151 | 134.55 |
| 7.779349392460001 | 134.64 |
| 7.106424596056484 | 134.73 |
| 6.249196771202863 | 134.82 |
| 5.803437676617018 | 134.91 |
| 5.220522243924667 | 135 |
| 4.86905820559071 | 135.09 |
| 4.449016377410505 | 135.18 |
| 4.058977218907315 | 135.27 |
| 3.90039012588637 | 135.36 |
| 3.81466729822161 | 135.45 |
| 3.8060950475358473 | 135.54 |
| 3.8446703138957314 | 135.63 |
| 3.7203720355058096 | 135.72 |
| 3.681796883210453 | 135.81 |
| 3.471775672969056 | 135.9 |
| 3.5832155915662827 | 135.99 |
| 3.7546609227754324 | 136.08 |
| 3.8746732131055435 | 136.17 |
| 3.8232396646285256 | 136.26 |
| 3.801808713391188 | 136.35 |
| 3.831811915138819 | 136.44 |
| 4.410440855527913 | 136.53 |
| 4.496163879623947 | 136.62 |
| 4.813338408736765 | 136.71 |
| 5.752003655542713 | 136.8 |
| 6.4849342778111145 | 136.89 |
| 6.999271333081948 | 136.98 |
| 7.6679098627979405 | 137.07 |
| 8.16938828153206 | 137.16 |
| 7.835069633784736 | 137.25 |
| 7.415027554189839 | 137.34 |
| 7.037846967553085 | 137.43 |
| 7.08499407848318 | 137.52 |
| 7.192148016405743 | 137.61 |
| 6.784964473650759 | 137.7 |
| 6.403497900956601 | 137.79 |
| 6.1163259007696364 | 137.88 |
| 5.584844140305703 | 137.97 |
| 4.937636635435874 | 138.06 |
| 4.346148741630327 | 138.15 |
| 3.626076732308514 | 138.24 |
| 3.017444587183676 | 138.33 |
| 2.704556049036213 | 138.42 |
| 2.511679698193333 | 138.51 |
| 2.1645022406036736 | 138.6 |
| 1.7830355054932152 | 138.69 |
| 1.6544510995619033 | 138.78 |
| 1.7101711421691164 | 138.87 |
| 2.05306234615394 | 138.96 |
| 2.3745230274252784 | 139.05 |
| 2.820282097817173 | 139.14 |
| 3.1674595409152415 | 139.23 |
| 3.5960738310911373 | 139.32 |
| 4.063263550084493 | 139.41 |
| 4.16613076941715 | 139.5 |
| 3.6732245159107135 | 139.59 |
| 3.501778786172428 | 139.68 |
| 3.3217606020919526 | 139.77 |
| 3.7117997845103967 | 139.86 |
| 4.3975825730598395 | 139.95 |
| 4.371865715334681 | 140.04 |
| 3.626076732308514 | 140.13 |
| 2.5073935547307995 | 140.22 |
| 2.203077534078528 | 140.31 |
| 1.8901890167343438 | 140.4 |
| 1.4872916112076224 | 140.49 |
| 1.3458488246700149 | 140.58 |
| 1.4787192311090427 | 140.67 |
| 1.5044362425906264 | 140.76 |
| 1.28155679134322 | 140.85 |
| 0.8443701294973962 | 140.94 |
| 0.6900690369934553 | 141.03 |
| 0.6686382797437482 | 141.12 |
| 0.9300929850533164 | 141.21 |
| 1.4744332278454464 | 141.3 |
| 1.8601860958748762 | 141.39 |
| 1.7830355054932152 | 141.48 |
| 1.7015987630820553 | 141.57 |
| 1.4187132626402705 | 141.66 |
| 1.3158458591023277 | 141.75 |
| 1.298701317466055 | 141.84 |
| 1.3458488246700149 | 141.93 |
| 1.4444301843544827 | 142.02 |
| 1.2386952065275842 | 142.11 |
| 0.9815267334812954 | 142.2 |
| 0.8958038817805101 | 142.29 |
| 0.9172346386488327 | 142.38 |
| 0.7800779592802646 | 142.47 |
| 0.6772105572528934 | 142.56 |
| 0.6172045815470992 | 142.65 |
| 0.6557798019503702 | 142.74 |
| 0.7415027476885869 | 142.83 |
| 0.7929364828264122 | 142.92 |
| 0.8443701294973962 | 143.01 |
| 0.8100810344364943 | 143.1 |
| 0.7800779592802646 | 143.19 |
| 0.7543611318088872 | 143.28 |
| 0.818653263544853 | 143.37 |
| 0.9815267334812954 | 143.46 |
| 0.8443701294973962 | 143.55 |
| 0.7629334058060919 | 143.64 |
| 0.7329304701479612 | 143.73 |
| 0.784364158014704 | 143.82 |
| 1.0072436103727216 | 143.91 |
| 1.1486863133018876 | 144 |
| 1.1958338308347203 | 144.09 |
| 1.2344091421340282 | 144.18 |
| 1.298701317466055 | 144.27 |
| 1.422999402201222 | 144.36 |
| 1.5987312560592732 | 144.45 |
| 1.9544812104750273 | 144.54 |
| 2.125926827980875 | 144.63 |
| 2.3316617116021012 | 144.72 |
| 2.6831254259343793 | 144.81 |
| 3.450345138328902 | 144.9 |
| 4.161844735312474 | 144.99 |
| 4.333290458744232 | 145.08 |
| 4.25185342046305 | 145.17 |
| 4.667609599370878 | 145.26 |
| 5.289100255128965 | 145.35 |
| 5.460545970360175 | 145.44 |
| 5.156229843462023 | 145.53 |
| 5.511979821220185 | 145.62 |
| 6.326347183453517 | 145.71 |
| 7.817925060373275 | 145.8 |
| 8.027945856334693 | 145.89 |
| 7.723629637857721 | 145.98 |
| 7.530753393936797 | 146.07 |
| 8.375123223351896 | 146.16 |
| 8.683725403263983 | 146.25 |
| 9.378080546236905 | 146.34 |
| 9.420941667997628 | 146.43 |
| 9.26664063415264 | 146.52 |
| 9.069478364100506 | 146.61 |
| 8.14795786734038 | 146.7 |
| 7.3550210512093805 | 146.79 |
| 7.329304484879826 | 146.88 |
| 8.143671814063241 | 146.97 |
| 8.563713904351369 | 147.06 |
| 8.220822087157451 | 147.15 |
| 6.793536373039245 | 147.24 |
| 5.439115445324314 | 147.33 |
| 4.813338408736765 | 147.42 |
| 4.66332327472214 | 147.51 |
| 4.577600926435988 | 147.6 |
| 4.826196691437072 | 147.69 |
| 5.319103137891236 | 147.78 |
| 5.541982702759334 | 147.87 |
| 6.129184562274414 | 147.96 |
| 7.024988236609417 | 148.05 |
| 7.822211017932609 | 148.14 |
| 8.19510495759622 | 148.23 |
| 8.036517864957176 | 148.32 |
| 8.353692712327671 | 148.41 |
| 9.652393731539396 | 148.5 |
| 10.85679998014052 | 148.59 |
| 11.30255931033346 | 148.68 |
| 11.979769291437131 | 148.77 |
| 12.648408017832107 | 148.86 |
| 12.995585884680287 | 148.95 |
| 13.03844691593562 | 149.04 |
| 12.682696980764579 | 149.13 |
| 12.134070987859644 | 149.22 |
| 11.049676691668214 | 149.31 |
| 9.883845639167523 | 149.4 |
| 8.362264609744727 | 149.49 |
| 7.689340488867245 | 149.58 |
| 7.333590534317308 | 149.67 |
| 7.736487587235906 | 149.76 |
| 8.049376479849387 | 149.85 |
| 7.809352385013637 | 149.94 |
| 6.733530637519741 | 150.03 |
| 6.330633151742209 | 150.12 |
| 5.563413682726974 | 150.21 |
| 4.804766048517676 | 150.3 |
| 4.757618552879121 | 150.39 |
| 5.439115445324314 | 150.48 |
| 6.832111587785737 | 150.57 |
| 7.719343013003864 | 150.66 |
| 7.890788722346574 | 150.75 |
| 7.907933294658788 | 150.84 |
| 8.263683717723795 | 150.93 |
| 9.420941667997628 | 151.02 |
| 9.656680219791415 | 151.11 |
| 10.119583548547123 | 151.2 |
| 11.002529009615548 | 151.29 |
| 12.768420414093296 | 151.38 |
| 14.70147013798326 | 151.47 |
| 15.327247753728784 | 151.56 |
| 15.160087851006807 | 151.65 |
| 15.27581305037293 | 151.74 |
| 15.640135634356334 | 151.83 |
| 16.154472586090716 | 151.92 |
| 16.66023772568551 | 152.01 |
| 16.728815235226747 | 152.1 |
| 15.884444845908732 | 152.19 |
| 15.074364798546872 | 152.28 |
| 14.727187730749073 | 152.37 |
| 14.315716659025826 | 152.46 |
| 13.582786984759473 | 152.55 |
| 13.299901797104912 | 152.64 |
| 13.055590647559942 | 152.73 |
| 13.732802122556976 | 152.82 |
| 13.844241706046438 | 152.91 |
| 13.595644063233175 | 153 |
| 14.315716659025826 | 153.09 |
| 15.824440119258012 | 153.18 |
| 16.22733738155124 | 153.27 |
| 15.211521820803148 | 153.36 |
| 14.410013542797678 | 153.45 |
| 13.068449819934678 | 153.54 |
| 11.692597599083 | 153.63 |
| 10.685353632641318 | 153.72 |
| 9.472376018151865 | 153.81 |
| 8.700870485186917 | 153.9 |
| 7.84364153198107 | 153.99 |
| 6.93497888305475 | 154.08 |
| 6.433500435105205 | 154.17 |
| 6.296343972189332 | 154.26 |
| 5.910591087862019 | 154.35 |
| 4.577600926435988 | 154.44 |
| 3.296044076656754 | 154.53 |
| 2.974583162895465 | 154.62 |
| 3.107453727456975 | 154.71 |
| 3.810381080009701 | 154.8 |
| 4.749046306776171 | 154.89 |
| 5.44768734624041 | 154.98 |
| 6.622090739880616 | 155.07 |
| 7.252153742202252 | 155.16 |
| 7.445030079946958 | 155.25 |
| 7.830783010463639 | 155.34 |
| 8.649436275618672 | 155.43 |
| 9.33950548259418 | 155.52 |
| 10.406755234032202 | 155.61 |
| 12.228365757964486 | 155.7 |
| 12.939864584788005 | 155.79 |
| 12.224080466290788 | 155.88 |
| 9.93099329453358 | 155.97 |
| 8.233680038176782 | 156.06 |
| 7.449315928649048 | 156.15 |
| 6.304916549255918 | 156.24 |
| 5.100509936089035 | 156.33 |
| 4.080408048173736 | 156.42 |
| 3.2146072629591376 | 156.51 |
| 2.9017188278268757 | 156.6 |
| 3.0303031032770775 | 156.69 |
| 2.906004972811854 | 156.78 |
| 2.618833457386244 | 156.87 |
| 2.4388153516264284 | 156.96 |
| 2.6145473134747186 | 157.05 |
| 2.19021901576081 | 157.14 |
| 1.6630235787225014 | 157.23 |
| 1.5172946261901976 | 157.32 |
| 1.2086923380866006 | 157.41 |
| 0.8915177621568553 | 157.5 |
| 0.750075013194171 | 157.59 |
| 0.7200719880612891 | 157.68 |
| 0.6814967590451247 | 157.77 |
| 0.6943551478886092 | 157.86 |
| 0.411469701857391 | 157.95 |
| 0.2914577132992246 | 158.04 |
| 0.18859027844333928 | 158.13 |
| 0.08572285460576032 | 158.22 |
| 0.07715057061250453 | 158.31 |
| 0.047147569833653404 | 158.4 |
| 0.004286142778363675 | 158.49 |
| 0.0 | 158.58 |
| 0.09000900325187754 | 158.67 |
| 0.13715657405782994 | 158.76 |
| 0.201448714562036 | 158.85 |
| 0.42861425900400557 | 158.94 |
| 0.9600959721529896 | 159.03 |
| 1.5472975509822129 | 159.12 |
| 2.464532152742508 | 159.21 |
| 3.4374863906022473 | 159.3 |
| 3.831811915138819 | 159.39 |
| 3.9646821455215004 | 159.48 |
| 3.9432512592176603 | 159.57 |
| 3.4974928713860036 | 159.66 |
| 3.2103212333959865 | 159.75 |
| 3.0731644407550722 | 159.84 |
| 3.3046159802048667 | 159.93 |
| 3.338905223607457 | 160.02 |
| 3.1803177852448288 | 160.11 |
| 2.966010908411335 | 160.2 |
| 2.5974026834077284 | 160.29 |
| 2.237366593074561 | 160.38 |
| 1.9159059137385317 | 160.47 |
| 1.7358879238598544 | 160.56 |
| 1.7444601842582883 | 160.65 |
| 1.7015987630820553 | 160.74 |
| 1.705885001545035 | 160.83 |
| 1.7015987630820553 | 160.92 |
| 1.5687283323665122 | 161.01 |
| 1.5172946261901976 | 161.1 |
| 1.5730144724796717 | 161.19 |
| 1.6801679823738238 | 161.28 |
| 1.8387553163639567 | 161.37 |
| 2.211649674472326 | 161.46 |
| 2.3873815165069305 | 161.55 |
| 2.1473576055977746 | 161.64 |
| 2.1387853468714484 | 161.73 |
| 2.4516738696551426 | 161.82 |
| 2.7774206701434623 | 161.91 |
| 3.2146072629591376 | 162 |
| 3.5660709292234993 | 162.09 |
| 4.0204019083088465 | 162.18 |
| 4.980498148753456 | 162.27 |
| 6.497792820209236 | 162.36 |
| 7.655051246218136 | 162.45 |
| 8.71801504933986 | 162.54 |
| 10.085294450700413 | 162.63 |
| 11.315417273212342 | 162.72 |
| 12.241224041129264 | 162.81 |
| 12.858428857469598 | 162.9 |
| 13.32561820298445 | 162.99 |
| 14.59431599841183 | 163.08 |
| 16.2230510811945 | 163.17 |
| 17.740346342109266 | 163.26 |
| 18.627576829502484 | 163.35 |
| 19.094766312966165 | 163.44 |
| 20.942092973197227 | 163.53 |
| 21.452145778805935 | 163.62 |
| 21.019244378715502 | 163.71 |
| 19.411940493279552 | 163.8 |
| 18.066092538724426 | 163.89 |
| 17.607474820178794 | 163.98 |
| 16.848827684954074 | 164.07 |
| 16.99884279065126 | 164.16 |
| 16.060178498350012 | 164.25 |
| 14.920062997999578 | 164.34 |
| 13.882816386988283 | 164.43 |
| 14.354292365991054 | 164.52 |
| 14.431442582558748 | 164.61 |
| 14.182846993288875 | 164.7 |
| 13.638506063278333 | 164.79 |
| 14.069364783366368 | 164.88 |
| 14.157091493403035 | 164.97 |
| 14.508661235652584 | 165.06 |
| 14.388612970642207 | 165.15 |
| 13.2395809786665 | 165.24 |
| 12.90087405354286 | 165.33 |
| 12.622192001120988 | 165.42 |
| 12.257759880007619 | 165.51 |
| 11.906191217110749 | 165.6 |
| 11.76470620117349 | 165.69 |
| 11.837592296495638 | 165.78 |
| 11.863316685999525 | 165.87 |
| 11.799005694886452 | 165.96 |
| 12.523580844959275 | 166.05 |
| 12.339220217210368 | 166.14 |
| 12.206311458839007 | 166.23 |
| 12.446406487501049 | 166.32 |
| 11.859029328608411 | 166.41 |
| 11.258788801423822 | 166.5 |
| 10.902932813085009 | 166.59 |
| 9.556679491366621 | 166.68 |
| 8.763505503373736 | 166.77 |
| 7.738809373751493 | 166.86 |
| 6.778425442040552 | 166.95 |
| 6.696964745836803 | 167.04 |
| 6.731264176374344 | 167.13 |
| 6.379694685070761 | 167.22 |
| 6.015263316531897 | 167.31 |
| 5.8223288086712826 | 167.4 |
| 6.096724508503151 | 167.49 |
| 6.787000699902129 | 167.58 |
| 7.464414569281738 | 167.67 |
| 6.902761262406151 | 167.76 |
| 6.259646681788614 | 167.85 |
| 6.662664881312923 | 167.94 |
| 7.382953332441161 | 168.03 |
| 8.030355112000029 | 168.12 |
| 8.999314135511142 | 168.21 |
| 10.615674942701922 | 168.3 |
| 11.597496405417301 | 168.39 |
| 11.996226983059564 | 168.48 |
| 12.862287782786161 | 168.57 |
| 13.209569072237286 | 168.66 |
| 14.414338111945993 | 168.75 |
| 16.356542580537887 | 168.84 |
| 16.982507992678876 | 168.93 |
| 17.07254257574873 | 169.02 |
| 17.57846033113771 | 169.11 |
| 16.896757964627437 | 169.2 |
| 16.62664937486065 | 169.29 |
| 17.445549924080964 | 169.38 |
| 18.946149851604797 | 169.47 |
| 19.43063023158347 | 169.56 |
| 19.567827450395843 | 169.65 |
| 18.534556260194478 | 169.74 |
| 17.90859185548305 | 169.83 |
| 17.68564581506635 | 169.92 |
| 18.380209129827502 | 170.01 |
| 18.997599167216357 | 170.1 |
| 19.10907232687643 | 170.19 |
| 18.55170694194806 | 170.28 |
| 17.265477734516544 | 170.37 |
| 15.734865950498635 | 170.46 |
| 14.658720539036855 | 170.55 |
| 13.715485040651066 | 170.64 |
| 13.269594568276103 | 170.73 |
| 13.565425754049523 | 170.82 |
| 14.058480411188679 | 170.91 |
| 14.761619374338169 | 171 |
| 15.769165419466075 | 171.09 |
| 16.54518914093634 | 171.18 |
| 17.574172760647023 | 171.27 |
| 18.24729970902822 | 171.36 |
| 18.397359053827163 | 171.45 |
| 18.251586286651623 | 171.54 |
| 18.66318008952456 | 171.63 |
| 19.28056990212788 | 171.72 |
| 19.126222994997256 | 171.81 |
| 18.152974307309123 | 171.9 |
| 16.841022021302425 | 171.99 |
| 15.996398214938537 | 172.08 |
| 15.722003808297352 | 172.17 |
| 16.519465862310863 | 172.26 |
| 17.912879637642902 | 172.35 |
| 19.554965543875966 | 172.44 |
| 18.78751515854466 | 172.53 |
| 16.90962110713205 | 172.62 |
| 16.690961690039455 | 172.71 |
| 17.119705183657697 | 172.8 |
| 16.746698639709585 | 172.89 |
| 16.129307801293145 | 172.98 |
| 16.08643479794375 | 173.07 |
| 14.714456712827692 | 173.16 |
| 14.10135445016264 | 173.25 |
| 14.740181846282338 | 173.34 |
| 14.568685017217614 | 173.43 |
| 13.766936182277083 | 173.52 |
| 13.248156383214443 | 173.61 |
| 13.31675535430173 | 173.7 |
| 12.819413728888469 | 173.79 |
| 13.586863950575074 | 173.88 |
| 14.560109628471269 | 173.97 |
| 15.09603746432665 | 174.06 |
| 15.087463104749949 | 174.15 |
| 15.41759656437837 | 174.24 |
| 15.331847592762069 | 174.33 |
| 15.074600963168324 | 174.42 |
| 15.464757164709347 | 174.51 |
| 15.807751654746632 | 174.6 |
| 16.107872310043067 | 174.69 |
| 16.09500915772699 | 174.78 |
| 16.305093226196917 | 174.87 |
| 17.312639308505045 | 174.96 |
| 16.866747103530955 | 175.05 |
| 16.16360725993278 | 175.14 |
| 15.563369115237219 | 175.23 |
| 15.027440359842235 | 175.32 |
| 14.68444585100829 | 175.41 |
| 14.624421190078953 | 175.5 |
| 14.967415565167336 | 175.59 |
| 15.516205546012497 | 175.68 |
| 14.967415565167336 | 175.77 |
| 14.950266845187757 | 175.86 |
| 15.413308782166874 | 175.95 |
| 16.30938000020427 | 176.04 |
| 17.432686787566468 | 176.13 |
| 18.350197284952248 | 176.22 |
| 18.83038914056056 | 176.31 |
| 20.02658184084487 | 176.4 |
| 21.745841327056056 | 176.49 |
| 22.071686007836018 | 176.58 |
| 23.173554193614656 | 176.67 |
| 23.439375565948104 | 176.76 |
| 23.473674848911084 | 176.85 |
| 22.98062021227268 | 176.94 |
| 21.42428416259723 | 177.03 |
| 19.374892210761008 | 177.12 |
| 17.634196469090927 | 177.21 |
| 16.360830165694114 | 177.3 |
| 14.967415565167336 | 177.39 |
| 14.157091493403035 | 177.48 |
| 13.86125862372628 | 177.57 |
| 12.712227451523187 | 177.66 |
| 12.892299693759615 | 177.75 |
| 13.483964405337728 | 177.84 |
| 14.174240212556436 | 177.93 |
| 14.354313295117871 | 178.02 |
| 14.791630235073194 | 178.11 |
| 16.08643479794375 | 178.2 |
| 16.206482247467545 | 178.29 |
| 16.326531718357025 | 178.38 |
| 15.799177295066661 | 178.47 |
| 13.856970841721358 | 178.56 |
| 11.43457385570257 | 178.65 |
| 9.95969795523209 | 178.74 |
| 9.136511779185188 | 178.83 |
| 8.98216432072326 | 178.92 |
| 8.750642921913746 | 179.01 |
| 9.183673658655826 | 179.1 |
| 10.191218660304848 | 179.19 |
| 11.121591687387435 | 179.28 |
| 11.931915501389389 | 179.37 |
| 12.18058552988218 | 179.46 |
| 13.389641145045442 | 179.55 |
| 14.890242173930554 | 179.64 |
| 15.477619306755718 | 179.73 |
| 15.88492609224566 | 179.82 |
| 16.240781705074372 | 179.91 |
| 16.189333527487968 | 180 |
| 15.674842266531689 | 180.09 |
| 15.254674089106738 | 180.18 |
| 14.877380032194019 | 180.27 |
| 13.698336156303819 | 180.36 |
| 12.433545400289027 | 180.45 |
| 10.99296849972631 | 180.54 |
| 9.88252398627122 | 180.63 |
| 9.200823362558804 | 180.72 |
| 8.604870814708095 | 180.81 |
| 8.038929693150287 | 180.9 |
| 7.27147990044618 | 180.99 |
| 6.576916738454496 | 181.08 |
| 6.495454934754717 | 181.17 |
| 6.894186117696431 | 181.26 |
| 7.121419686832857 | 181.35 |
| 7.190019106995446 | 181.44 |
| 7.725947565583653 | 181.53 |
| 8.707768928914184 | 181.62 |
| 9.608129167703959 | 181.71 |
| 10.73143565981377 | 181.8 |
| 10.495626338277294 | 181.89 |
| 10.924369719559557 | 181.98 |
| 10.881495774775532 | 182.07 |
| 10.950094002815751 | 182.16 |
| 10.971531700919547 | 182.25 |
| 10.679986467759374 | 182.34 |
| 10.105470828799923 | 182.43 |
| 9.608129167703959 | 182.52 |
| 9.359458050842317 | 182.61 |
| 10.384154124224303 | 182.7 |
| 11.323100986910745 | 182.79 |
| 11.841879653809295 | 182.88 |
| 11.524609639776754 | 182.97 |
| 10.842909157406066 | 183.06 |
| 10.525639126218973 | 183.15 |
| 10.457039607900539 | 183.24 |
| 10.615674942701922 | 183.33 |
| 10.156920031812163 | 183.42 |
| 9.706739484960728 | 183.51 |
| 9.548104907722191 | 183.6 |
| 8.862116383720053 | 183.69 |
| 8.330474671465746 | 183.78 |
| 8.630594994448302 | 183.87 |
| 9.380894988966542 | 183.96 |
| 9.07648753665748 | 184.05 |
| 9.273709521676048 | 184.14 |
| 9.84822512616115 | 184.23 |
| 10.392728699993745 | 184.32 |
| 11.190190687619888 | 184.41 |
| 12.67792775580791 | 184.5 |
| 14.602984688920637 | 184.59 |
| 15.996398214938537 | 184.68 |
| 17.818556217320637 | 184.77 |
| 18.333047581555334 | 184.86 |
| 18.30732241515488 | 184.95 |
| 18.86040195692446 | 185.04 |
| 20.21522931799441 | 185.13 |
| 21.724404825123163 | 185.22 |
| 22.749098424578555 | 185.31 |
| 23.537987612524923 | 185.4 |
| 24.10392673028474 | 185.49 |
| 24.27113606760859 | 185.58 |
| 24.40404738196643 | 185.67 |
| 23.092094395525386 | 185.76 |
| 20.51963655458063 | 185.85 |
| 17.895730702327747 | 185.94 |
| 17.325502446155575 | 186.03 |
| 17.39409952296137 | 186.12 |
| 16.785286066720055 | 186.21 |
| 16.656663046060203 | 186.3 |
| 16.763848563296133 | 186.39 |
| 17.587034691024225 | 186.48 |
| 17.968615555148297 | 186.57 |
| 17.582747120636814 | 186.66 |
| 16.849596381188938 | 186.75 |
| 16.30938000020427 | 186.84 |
| 16.176471385286682 | 186.93 |
| 15.953524200338281 | 187.02 |
| 16.849596381188938 | 187.11 |
| 18.05865218674602 | 187.2 |
| 19.276282352189614 | 187.29 |
| 19.799347939157048 | 187.38 |
| 19.606413876534955 | 187.47 |
| 19.10049796688664 | 187.56 |
| 18.671754449411075 | 187.65 |
| 17.479849351427195 | 187.74 |
| 16.493740771406948 | 187.83 |
| 15.81203842281547 | 187.92 |
| 15.113189138431121 | 188.01 |
| 14.367175437319158 | 188.1 |
| 14.362887655107661 | 188.19 |
| 14.864516865057487 | 188.28 |
| 14.45721214508472 | 188.37 |
| 14.482935223814817 | 188.46 |
| 14.825930617951553 | 188.55 |
| 15.288972733499099 | 188.64 |
| 15.087463104749949 | 188.73 |
| 14.55582202167821 | 188.82 |
| 13.496827589257022 | 188.91 |
| 13.0166357394323 | 189 |
| 12.905161680217022 | 189.09 |
| 12.836562448868047 | 189.18 |
| 12.746526992888835 | 189.27 |
| 12.51071870275799 | 189.36 |
| 11.944777923888369 | 189.45 |
| 12.026238479762554 | 189.54 |
| 12.94803573153277 | 189.63 |
| 14.037043908997603 | 189.72 |
| 14.697307816035405 | 189.81 |
| 15.421883142156661 | 189.9 |
| 15.867776359156199 | 189.99 |
| 16.3479682205481 | 190.08 |
| 16.690961690039455 | 190.17 |
| 16.652375464467084 | 190.26 |
| 15.383295974426703 | 190.35 |
| 15.061737979970685 | 190.44 |
| 14.774480489435387 | 190.53 |
| 14.572972799274181 | 190.62 |
| 13.71119829788544 | 190.71 |
| 12.806551586687181 | 190.8 |
| 11.305951305806484 | 190.89 |
| 10.439889899680521 | 190.98 |
| 9.925399094357777 | 191.07 |
| 9.338021115785464 | 191.16 |
| 8.952152369321457 | 191.25 |
| 9.243697349439122 | 191.34 |
| 10.036871324031639 | 191.43 |
| 10.452752365071035 | 191.52 |
| 11.010118316832788 | 191.61 |
| 10.765735033568824 | 191.7 |
| 9.548104907722191 | 191.79 |
| 9.187960893899525 | 191.88 |
| 9.779626327925838 | 191.97 |
| 10.645686449598488 | 192.06 |
| 11.43457385570257 | 192.15 |
| 10.821471473812883 | 192.24 |
| 9.938261019457451 | 192.33 |
| 9.835362658679252 | 192.42 |
| 9.96398583425679 | 192.51 |
| 9.938261019457451 | 192.6 |
| 9.779626327925838 | 192.69 |
| 9.85679970295306 | 192.78 |
| 9.908249506508788 | 192.87 |
| 9.792488795949954 | 192.96 |
| 9.389470221731457 | 193.05 |
| 9.389470221731457 | 193.14 |
| 8.48911001896004 | 193.23 |
| 6.795575171788963 | 193.32 |
| 5.848053475927044 | 193.41 |
| 5.625107350377928 | 193.5 |
| 5.496484203522118 | 193.59 |
| 5.732292812447693 | 193.68 |
| 5.852341031225469 | 193.77 |
| 5.462185056132754 | 193.86 |
| 5.21351403704481 | 193.95 |
| 4.913393720987064 | 194.04 |
| 4.308866287232077 | 194.13 |
| 3.8972730002607863 | 194.22 |
| 3.678614156053698 | 194.31 |
| 3.4256559095195795 | 194.4 |
| 4.133081840297685 | 194.49 |
| 4.8405075600263014 | 194.58 |
| 5.6379694924707735 | 194.67 |
| 6.353969981729521 | 194.76 |
| 6.246784276253116 | 194.85 |
| 5.509346686945051 | 194.94 |
| 5.2649629977296835 | 195.03 |
| 4.750471536495886 | 195.12 |
| 3.3699193682692083 | 195.21 |
| 2.7053678724965717 | 195.3 |
| 2.4095353415472776 | 195.39 |
| 2.3580860713678984 | 195.48 |
| 2.9025896586473405 | 195.57 |
| 3.12982326927071 | 195.66 |
| 2.452409638107996 | 195.75 |
| 2.709655303163739 | 195.84 |
| 2.748242165292792 | 195.93 |
| 2.4095353415472776 | 196.02 |
| 1.8435945479501528 | 196.11 |
| 1.3977019354909808 | 196.2 |
| 1.046132736331127 | 196.29 |
| 1.1576058839664827 | 196.38 |
| 1.0804322014979315 | 196.47 |
| 0.9646715536358295 | 196.56 |
| 0.7288629695120576 | 196.65 |
| 0.5144914999095067 | 196.74 |
| 0.5187789714759712 | 196.83 |
| 0.5316412016870159 | 196.92 |
| 0.6259646227921208 | 197.01 |
| 0.7974618018199677 | 197.1 |
| 1.5691991212484535 | 197.19 |
| 1.736408878770965 | 197.28 |
| 1.8907562787359837 | 197.37 |
| 1.9250556075339382 | 197.46 |
| 1.7621333987619965 | 197.55 |
| 1.7321213543114822 | 197.64 |
| 1.3848396915810832 | 197.73 |
| 1.1447437041511883 | 197.82 |
| 1.376264737807378 | 197.91 |
| 1.5906360968266076 | 198 |
| 1.5520493346814106 | 198.09 |
| 1.8993311110594064 | 198.18 |
| 2.0622534372537684 | 198.27 |
| 2.0879780819844993 | 198.36 |
| 2.5167208743885947 | 198.45 |
| 3.3184703747004813 | 198.54 |
| 3.854398955529048 | 198.63 |
| 4.527525112864539 | 198.72 |
| 4.947693280385119 | 198.81 |
| 4.960555422137149 | 198.9 |
| 4.92196871261748 | 198.99 |
| 4.068770174714435 | 199.08 |
| 3.7429256323637223 | 199.17 |
| 3.6829018221802214 | 199.26 |
| 4.1588065859417815 | 199.35 |
| 5.179214542133813 | 199.44 |
| 5.539358572491354 | 199.53 |
| 5.410735542970188 | 199.62 |
| 5.123477715736838 | 199.71 |
| 5.204939220543644 | 199.8 |
| 4.819070485750107 | 199.89 |
| 5.012004971090857 | 199.98 |
| 4.90910657066406 | 200.07 |
| 4.810495667555173 | 200.16 |
| 4.548962462635968 | 200.25 |
| 4.368890428593388 | 200.34 |
| 4.544675195045463 | 200.43 |
| 4.201680577128811 | 200.52 |
| 4.5832619114486315 | 200.61 |
| 5.71943067075763 | 200.7 |
| 5.745154884941206 | 200.79 |
| 5.78802971080393 | 200.88 |
| 6.221059991819562 | 200.97 |
| 6.07528744078514 | 201.06 |
| 5.449322244093324 | 201.15 |
| 5.054879004358682 | 201.24 |
| 4.608986599659585 | 201.33 |
| 3.880123239095074 | 201.42 |
| 3.3098953495871926 | 201.51 |
| 2.8211284887570196 | 201.6 |
| 2.5338706805837043 | 201.69 |
| 1.9379181019766767 | 201.78 |
| 1.9379181019766767 | 201.87 |
| 1.7621333987619965 | 201.96 |
| 1.744983711776025 | 202.05 |
| 1.7321213543114822 | 202.14 |
| 1.7492711387819726 | 202.23 |
| 1.7707082316224667 | 202.32 |
| 1.6978220006027709 | 202.41 |
| 1.659235239578149 | 202.5 |
| 2.070828268616702 | 202.59 |
| 2.469559180060052 | 202.68 |
| 2.5553078917038317 | 202.77 |
| 2.7010805915831475 | 202.86 |
| 2.979763292366402 | 202.95 |
| 3.361344426480966 | 203.04 |
| 3.352769600994577 | 203.13 |
| 2.8854398863069024 | 203.22 |
| 2.589607239876818 | 203.31 |
| 2.5381579624782824 | 203.4 |
| 2.8382780272285957 | 203.49 |
| 3.4856799341091205 | 203.58 |
| 4.2488424888119924 | 203.67 |
| 4.493225949332742 | 203.76 |
| 4.994854920590597 | 203.85 |
| 4.810495667555173 | 203.94 |
| 4.677585208002003 | 204.03 |
| 4.874807010357155 | 204.12 |
| 5.21351403704481 | 204.21 |
| 6.212485031771687 | 204.3 |
| 6.345395509331457 | 204.39 |
| 6.589778542857824 | 204.48 |
| 6.645515150144433 | 204.57 |
| 6.186760145390066 | 204.66 |
| 6.555479865493813 | 204.75 |
| 5.998113578221705 | 204.84 |
| 5.3764363948165546 | 204.93 |
| 5.466472317077293 | 205.02 |
| 4.999142545927294 | 205.11 |
| 3.8115246082173018 | 205.2 |
| 3.3056077239045134 | 205.29 |
| 3.069799445722979 | 205.38 |
| 3.0226377254457306 | 205.47 |
| 2.7996912849903173 | 205.56 |
| 2.456696920715191 | 205.65 |
| 2.4395472611289906 | 205.74 |
| 2.671068278877209 | 205.83 |
| 3.0354998675695586 | 205.92 |
| 3.42136870907038 | 206.01 |
| 2.6582061372026367 | 206.1 |
| 1.740696305766585 | 206.19 |
| 2.148002046120006 | 206.28 |
| 2.190876319344963 | 206.37 |
| 2.1265648369466765 | 206.46 |
| 2.5381579624782824 | 206.55 |
| 2.9111644043356413 | 206.64 |
| 3.2198591548366156 | 206.73 |
| 3.8243870517902465 | 206.82 |
| 5.054879004358682 | 206.91 |
| 7.04424622359551 | 207 |
| 8.754930158985479 | 207.09 |
| 10.234094008653196 | 207.18 |
| 11.773280809093514 | 207.27 |
| 12.073400904765396 | 207.36 |
| 12.47213167528015 | 207.45 |
| 13.483964405337728 | 207.54 |
| 14.487223005819736 | 207.63 |
| 15.404732475585028 | 207.72 |
| 16.06499829626905 | 207.81 |
| 15.11747589823768 | 207.9 |
| 13.256730742791149 | 207.99 |
| 12.043388877629512 | 208.08 |
| 11.301664057782077 | 208.17 |
| 11.357399844211628 | 208.26 |
| 12.454980847284293 | 208.35 |
| 14.024179886715595 | 208.44 |
| 15.61481749597232 | 208.53 |
| 17.02109421381028 | 208.62 |
| 18.041502479837636 | 208.71 |
| 19.070484981507555 | 208.8 |
| 19.447779185385468 | 208.89 |
| 19.743612065751552 | 208.98 |
| 19.03618536361259 | 209.07 |
| 18.140113370160645 | 209.16 |
| 16.96964485058735 | 209.25 |
| 15.996398214938537 | 209.34 |
| 15.160349924456746 | 209.43 |
| 14.225690497332868 | 209.52 |
| 13.565425754049523 | 209.61 |
| 13.243868601209524 | 209.7 |
| 13.74121102506841 | 209.79 |
| 15.396158116008326 | 209.88 |
| 17.4069637075971 | 209.97 |
| 18.1744128884952 | 210.06 |
| 19.434917043339098 | 210.15 |
| 21.167038402917772 | 210.24 |
| 23.10924404160276 | 210.33 |
| 24.50265852728391 | 210.42 |
| 25.454468458419154 | 210.51 |
| 25.463042817995856 | 210.6 |
| 25.201508591059042 | 210.69 |
| 26.007547195081692 | 210.78 |
| 27.29377517995466 | 210.87 |
| 27.41382289655652 | 210.96 |
| 26.702109440601145 | 211.05 |
| 27.0150910294313 | 211.14 |
| 28.961583712093447 | 211.23 |
| 29.630422458901094 | 211.32 |
| 30.320699848913492 | 211.41 |
| 31.08386244284152 | 211.5 |
| 31.60264078712404 | 211.59 |
| 30.980964187035504 | 211.68 |
| 31.791288247800665 | 211.77 |
| 32.09140698495829 | 211.86 |
| 31.242497133990998 | 211.95 |
| 30.616532729279577 | 212.04 |
| 30.676556957782047 | 212.13 |
| 30.56508185225293 | 212.22 |
| 29.699022868657032 | 212.31 |
| 28.1598358964595 | 212.4 |
| 27.426684164350885 | 212.49 |
| 27.88543951802631 | 212.58 |
| 28.284170216091216 | 212.67 |
| 28.091236389047275 | 212.76 |
| 27.057965661223477 | 212.85 |
| 25.300118855876153 | 212.94 |
| 24.57983078653736 | 213.03 |
| 24.374035610367223 | 213.12 |
| 23.73520844631419 | 213.21 |
| 22.757676015324535 | 213.3 |
| 21.552907047084485 | 213.39 |
| 20.948379137024812 | 213.48 |
| 22.067399164373906 | 213.57 |
| 23.51226099093123 | 213.66 |
| 23.542274190303218 | 213.75 |
| 23.010632928663064 | 213.84 |
| 22.821985521123196 | 213.93 |
| 21.497170864824795 | 214.02 |
| 20.258102321343806 | 214.11 |
| 20.21522931799441 | 214.2 |
| 19.606413876534955 | 214.29 |
| 19.460641093041414 | 214.38 |
| 20.356714328416604 | 214.47 |
| 19.85937278779495 | 214.56 |
| 17.972903337204865 | 214.65 |
| 15.720843332335194 | 214.74 |
| 13.351853823310405 | 214.83 |
| 12.11918643423261 | 214.92 |